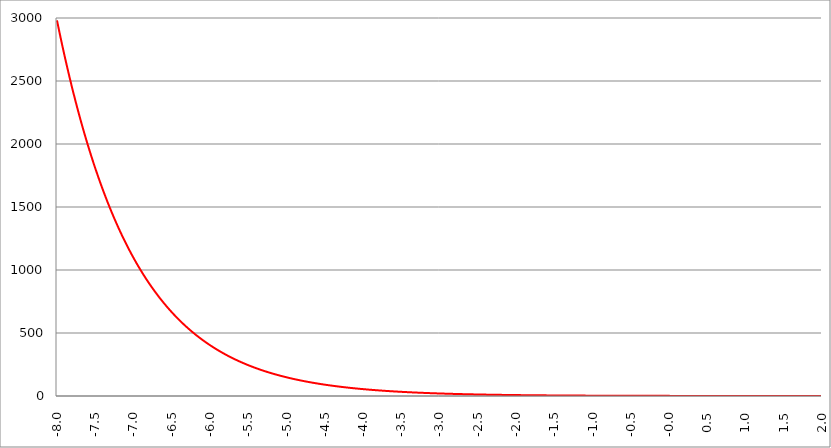
| Category | Series 1 | Series 0 | Series 2 |
|---|---|---|---|
| -8.0 | 2980.958 |  |  |
| -7.995 | 2966.09 |  |  |
| -7.99 | 2951.297 |  |  |
| -7.985 | 2936.577 |  |  |
| -7.98 | 2921.931 |  |  |
| -7.975 | 2907.358 |  |  |
| -7.97 | 2892.857 |  |  |
| -7.965000000000001 | 2878.429 |  |  |
| -7.960000000000001 | 2864.073 |  |  |
| -7.955000000000001 | 2849.788 |  |  |
| -7.950000000000001 | 2835.575 |  |  |
| -7.945000000000001 | 2821.432 |  |  |
| -7.940000000000001 | 2807.361 |  |  |
| -7.935000000000001 | 2793.359 |  |  |
| -7.930000000000001 | 2779.427 |  |  |
| -7.925000000000002 | 2765.564 |  |  |
| -7.920000000000002 | 2751.771 |  |  |
| -7.915000000000002 | 2738.047 |  |  |
| -7.910000000000002 | 2724.39 |  |  |
| -7.905000000000002 | 2710.803 |  |  |
| -7.900000000000002 | 2697.282 |  |  |
| -7.895000000000002 | 2683.83 |  |  |
| -7.890000000000002 | 2670.444 |  |  |
| -7.885000000000002 | 2657.125 |  |  |
| -7.880000000000002 | 2643.873 |  |  |
| -7.875000000000003 | 2630.686 |  |  |
| -7.870000000000003 | 2617.566 |  |  |
| -7.865000000000003 | 2604.51 |  |  |
| -7.860000000000003 | 2591.52 |  |  |
| -7.855000000000003 | 2578.595 |  |  |
| -7.850000000000003 | 2565.734 |  |  |
| -7.845000000000003 | 2552.938 |  |  |
| -7.840000000000003 | 2540.205 |  |  |
| -7.835000000000003 | 2527.536 |  |  |
| -7.830000000000004 | 2514.929 |  |  |
| -7.825000000000004 | 2502.386 |  |  |
| -7.820000000000004 | 2489.905 |  |  |
| -7.815000000000004 | 2477.487 |  |  |
| -7.810000000000004 | 2465.13 |  |  |
| -7.805000000000004 | 2452.836 |  |  |
| -7.800000000000004 | 2440.602 |  |  |
| -7.795000000000004 | 2428.429 |  |  |
| -7.790000000000004 | 2416.318 |  |  |
| -7.785000000000004 | 2404.266 |  |  |
| -7.780000000000004 | 2392.275 |  |  |
| -7.775000000000004 | 2380.343 |  |  |
| -7.770000000000004 | 2368.471 |  |  |
| -7.765000000000005 | 2356.658 |  |  |
| -7.760000000000005 | 2344.905 |  |  |
| -7.755000000000005 | 2333.209 |  |  |
| -7.750000000000005 | 2321.572 |  |  |
| -7.745000000000005 | 2309.994 |  |  |
| -7.740000000000005 | 2298.472 |  |  |
| -7.735000000000005 | 2287.009 |  |  |
| -7.730000000000005 | 2275.602 |  |  |
| -7.725000000000006 | 2264.253 |  |  |
| -7.720000000000006 | 2252.96 |  |  |
| -7.715000000000006 | 2241.723 |  |  |
| -7.710000000000006 | 2230.542 |  |  |
| -7.705000000000006 | 2219.417 |  |  |
| -7.700000000000006 | 2208.348 |  |  |
| -7.695000000000006 | 2197.334 |  |  |
| -7.690000000000006 | 2186.375 |  |  |
| -7.685000000000007 | 2175.47 |  |  |
| -7.680000000000007 | 2164.62 |  |  |
| -7.675000000000007 | 2153.824 |  |  |
| -7.670000000000007 | 2143.081 |  |  |
| -7.665000000000007 | 2132.393 |  |  |
| -7.660000000000007 | 2121.757 |  |  |
| -7.655000000000007 | 2111.175 |  |  |
| -7.650000000000007 | 2100.646 |  |  |
| -7.645000000000007 | 2090.169 |  |  |
| -7.640000000000008 | 2079.744 |  |  |
| -7.635000000000008 | 2069.371 |  |  |
| -7.630000000000008 | 2059.05 |  |  |
| -7.625000000000008 | 2048.78 |  |  |
| -7.620000000000008 | 2038.562 |  |  |
| -7.615000000000008 | 2028.395 |  |  |
| -7.610000000000008 | 2018.278 |  |  |
| -7.605000000000008 | 2008.212 |  |  |
| -7.600000000000008 | 1998.196 |  |  |
| -7.595000000000009 | 1988.23 |  |  |
| -7.590000000000009 | 1978.314 |  |  |
| -7.585000000000009 | 1968.447 |  |  |
| -7.580000000000009 | 1958.629 |  |  |
| -7.57500000000001 | 1948.86 |  |  |
| -7.57000000000001 | 1939.14 |  |  |
| -7.565000000000009 | 1929.469 |  |  |
| -7.560000000000009 | 1919.846 |  |  |
| -7.555000000000009 | 1910.27 |  |  |
| -7.55000000000001 | 1900.743 |  |  |
| -7.54500000000001 | 1891.263 |  |  |
| -7.54000000000001 | 1881.83 |  |  |
| -7.53500000000001 | 1872.444 |  |  |
| -7.53000000000001 | 1863.106 |  |  |
| -7.52500000000001 | 1853.813 |  |  |
| -7.52000000000001 | 1844.567 |  |  |
| -7.51500000000001 | 1835.367 |  |  |
| -7.51000000000001 | 1826.214 |  |  |
| -7.505000000000011 | 1817.105 |  |  |
| -7.500000000000011 | 1808.042 |  |  |
| -7.495000000000011 | 1799.025 |  |  |
| -7.490000000000011 | 1790.052 |  |  |
| -7.485000000000011 | 1781.124 |  |  |
| -7.480000000000011 | 1772.241 |  |  |
| -7.475000000000011 | 1763.402 |  |  |
| -7.470000000000011 | 1754.607 |  |  |
| -7.465000000000011 | 1745.856 |  |  |
| -7.460000000000011 | 1737.148 |  |  |
| -7.455000000000012 | 1728.484 |  |  |
| -7.450000000000012 | 1719.863 |  |  |
| -7.445000000000012 | 1711.285 |  |  |
| -7.440000000000012 | 1702.75 |  |  |
| -7.435000000000012 | 1694.258 |  |  |
| -7.430000000000012 | 1685.808 |  |  |
| -7.425000000000012 | 1677.4 |  |  |
| -7.420000000000012 | 1669.034 |  |  |
| -7.415000000000012 | 1660.709 |  |  |
| -7.410000000000013 | 1652.426 |  |  |
| -7.405000000000013 | 1644.185 |  |  |
| -7.400000000000013 | 1635.984 |  |  |
| -7.395000000000013 | 1627.825 |  |  |
| -7.390000000000013 | 1619.706 |  |  |
| -7.385000000000013 | 1611.628 |  |  |
| -7.380000000000013 | 1603.59 |  |  |
| -7.375000000000013 | 1595.592 |  |  |
| -7.370000000000013 | 1587.634 |  |  |
| -7.365000000000013 | 1579.715 |  |  |
| -7.360000000000014 | 1571.837 |  |  |
| -7.355000000000014 | 1563.997 |  |  |
| -7.350000000000014 | 1556.197 |  |  |
| -7.345000000000014 | 1548.435 |  |  |
| -7.340000000000014 | 1540.712 |  |  |
| -7.335000000000014 | 1533.028 |  |  |
| -7.330000000000014 | 1525.382 |  |  |
| -7.325000000000014 | 1517.774 |  |  |
| -7.320000000000014 | 1510.204 |  |  |
| -7.315000000000015 | 1502.672 |  |  |
| -7.310000000000015 | 1495.177 |  |  |
| -7.305000000000015 | 1487.72 |  |  |
| -7.300000000000015 | 1480.3 |  |  |
| -7.295000000000015 | 1472.917 |  |  |
| -7.290000000000015 | 1465.571 |  |  |
| -7.285000000000015 | 1458.261 |  |  |
| -7.280000000000015 | 1450.988 |  |  |
| -7.275000000000015 | 1443.751 |  |  |
| -7.270000000000015 | 1436.55 |  |  |
| -7.265000000000016 | 1429.386 |  |  |
| -7.260000000000016 | 1422.257 |  |  |
| -7.255000000000016 | 1415.163 |  |  |
| -7.250000000000016 | 1408.105 |  |  |
| -7.245000000000016 | 1401.082 |  |  |
| -7.240000000000016 | 1394.094 |  |  |
| -7.235000000000016 | 1387.141 |  |  |
| -7.230000000000016 | 1380.223 |  |  |
| -7.225000000000017 | 1373.339 |  |  |
| -7.220000000000017 | 1366.489 |  |  |
| -7.215000000000017 | 1359.674 |  |  |
| -7.210000000000017 | 1352.892 |  |  |
| -7.205000000000017 | 1346.145 |  |  |
| -7.200000000000017 | 1339.431 |  |  |
| -7.195000000000017 | 1332.75 |  |  |
| -7.190000000000017 | 1326.103 |  |  |
| -7.185000000000017 | 1319.489 |  |  |
| -7.180000000000017 | 1312.908 |  |  |
| -7.175000000000018 | 1306.36 |  |  |
| -7.170000000000018 | 1299.845 |  |  |
| -7.165000000000018 | 1293.362 |  |  |
| -7.160000000000018 | 1286.911 |  |  |
| -7.155000000000018 | 1280.492 |  |  |
| -7.150000000000018 | 1274.106 |  |  |
| -7.145000000000018 | 1267.751 |  |  |
| -7.140000000000018 | 1261.428 |  |  |
| -7.135000000000018 | 1255.137 |  |  |
| -7.130000000000019 | 1248.877 |  |  |
| -7.125000000000019 | 1242.648 |  |  |
| -7.120000000000019 | 1236.45 |  |  |
| -7.115000000000019 | 1230.284 |  |  |
| -7.110000000000019 | 1224.148 |  |  |
| -7.105000000000019 | 1218.042 |  |  |
| -7.100000000000019 | 1211.967 |  |  |
| -7.095000000000019 | 1205.922 |  |  |
| -7.090000000000019 | 1199.908 |  |  |
| -7.085000000000019 | 1193.923 |  |  |
| -7.08000000000002 | 1187.969 |  |  |
| -7.07500000000002 | 1182.044 |  |  |
| -7.07000000000002 | 1176.148 |  |  |
| -7.06500000000002 | 1170.282 |  |  |
| -7.06000000000002 | 1164.445 |  |  |
| -7.05500000000002 | 1158.637 |  |  |
| -7.05000000000002 | 1152.859 |  |  |
| -7.04500000000002 | 1147.109 |  |  |
| -7.04000000000002 | 1141.388 |  |  |
| -7.03500000000002 | 1135.695 |  |  |
| -7.03000000000002 | 1130.031 |  |  |
| -7.025000000000021 | 1124.395 |  |  |
| -7.020000000000021 | 1118.787 |  |  |
| -7.015000000000021 | 1113.207 |  |  |
| -7.010000000000021 | 1107.655 |  |  |
| -7.005000000000021 | 1102.13 |  |  |
| -7.000000000000021 | 1096.633 |  |  |
| -6.995000000000021 | 1091.164 |  |  |
| -6.990000000000021 | 1085.721 |  |  |
| -6.985000000000021 | 1080.306 |  |  |
| -6.980000000000021 | 1074.918 |  |  |
| -6.975000000000021 | 1069.557 |  |  |
| -6.970000000000021 | 1064.223 |  |  |
| -6.965000000000022 | 1058.915 |  |  |
| -6.960000000000022 | 1053.634 |  |  |
| -6.955000000000022 | 1048.379 |  |  |
| -6.950000000000022 | 1043.15 |  |  |
| -6.945000000000022 | 1037.947 |  |  |
| -6.940000000000022 | 1032.77 |  |  |
| -6.935000000000022 | 1027.619 |  |  |
| -6.930000000000022 | 1022.494 |  |  |
| -6.925000000000023 | 1017.394 |  |  |
| -6.920000000000023 | 1012.32 |  |  |
| -6.915000000000023 | 1007.271 |  |  |
| -6.910000000000023 | 1002.247 |  |  |
| -6.905000000000023 | 997.249 |  |  |
| -6.900000000000023 | 992.275 |  |  |
| -6.895000000000023 | 987.326 |  |  |
| -6.890000000000024 | 982.401 |  |  |
| -6.885000000000024 | 977.502 |  |  |
| -6.880000000000024 | 972.626 |  |  |
| -6.875000000000024 | 967.775 |  |  |
| -6.870000000000024 | 962.949 |  |  |
| -6.865000000000024 | 958.146 |  |  |
| -6.860000000000024 | 953.367 |  |  |
| -6.855000000000024 | 948.612 |  |  |
| -6.850000000000024 | 943.881 |  |  |
| -6.845000000000024 | 939.173 |  |  |
| -6.840000000000024 | 934.489 |  |  |
| -6.835000000000024 | 929.828 |  |  |
| -6.830000000000024 | 925.191 |  |  |
| -6.825000000000025 | 920.576 |  |  |
| -6.820000000000025 | 915.985 |  |  |
| -6.815000000000025 | 911.417 |  |  |
| -6.810000000000025 | 906.871 |  |  |
| -6.805000000000025 | 902.348 |  |  |
| -6.800000000000025 | 897.847 |  |  |
| -6.795000000000025 | 893.369 |  |  |
| -6.790000000000025 | 888.914 |  |  |
| -6.785000000000025 | 884.48 |  |  |
| -6.780000000000025 | 880.069 |  |  |
| -6.775000000000026 | 875.679 |  |  |
| -6.770000000000026 | 871.312 |  |  |
| -6.765000000000026 | 866.966 |  |  |
| -6.760000000000026 | 862.642 |  |  |
| -6.755000000000026 | 858.34 |  |  |
| -6.750000000000026 | 854.059 |  |  |
| -6.745000000000026 | 849.799 |  |  |
| -6.740000000000026 | 845.561 |  |  |
| -6.735000000000026 | 841.343 |  |  |
| -6.730000000000026 | 837.147 |  |  |
| -6.725000000000027 | 832.972 |  |  |
| -6.720000000000027 | 828.818 |  |  |
| -6.715000000000027 | 824.684 |  |  |
| -6.710000000000027 | 820.571 |  |  |
| -6.705000000000027 | 816.478 |  |  |
| -6.700000000000027 | 812.406 |  |  |
| -6.695000000000028 | 808.354 |  |  |
| -6.690000000000028 | 804.322 |  |  |
| -6.685000000000028 | 800.311 |  |  |
| -6.680000000000028 | 796.319 |  |  |
| -6.675000000000028 | 792.347 |  |  |
| -6.670000000000028 | 788.396 |  |  |
| -6.665000000000028 | 784.463 |  |  |
| -6.660000000000028 | 780.551 |  |  |
| -6.655000000000029 | 776.658 |  |  |
| -6.650000000000029 | 772.784 |  |  |
| -6.645000000000029 | 768.93 |  |  |
| -6.640000000000029 | 765.095 |  |  |
| -6.63500000000003 | 761.279 |  |  |
| -6.63000000000003 | 757.482 |  |  |
| -6.625000000000029 | 753.704 |  |  |
| -6.620000000000029 | 749.945 |  |  |
| -6.615000000000029 | 746.205 |  |  |
| -6.61000000000003 | 742.483 |  |  |
| -6.60500000000003 | 738.78 |  |  |
| -6.60000000000003 | 735.095 |  |  |
| -6.59500000000003 | 731.429 |  |  |
| -6.59000000000003 | 727.781 |  |  |
| -6.58500000000003 | 724.151 |  |  |
| -6.58000000000003 | 720.539 |  |  |
| -6.57500000000003 | 716.946 |  |  |
| -6.57000000000003 | 713.37 |  |  |
| -6.565000000000031 | 709.812 |  |  |
| -6.560000000000031 | 706.272 |  |  |
| -6.555000000000031 | 702.749 |  |  |
| -6.550000000000031 | 699.244 |  |  |
| -6.545000000000031 | 695.757 |  |  |
| -6.540000000000031 | 692.287 |  |  |
| -6.535000000000031 | 688.834 |  |  |
| -6.530000000000031 | 685.398 |  |  |
| -6.525000000000031 | 681.98 |  |  |
| -6.520000000000032 | 678.578 |  |  |
| -6.515000000000032 | 675.194 |  |  |
| -6.510000000000032 | 671.826 |  |  |
| -6.505000000000032 | 668.476 |  |  |
| -6.500000000000032 | 665.142 |  |  |
| -6.495000000000032 | 661.824 |  |  |
| -6.490000000000032 | 658.523 |  |  |
| -6.485000000000032 | 655.239 |  |  |
| -6.480000000000032 | 651.971 |  |  |
| -6.475000000000032 | 648.719 |  |  |
| -6.470000000000032 | 645.484 |  |  |
| -6.465000000000033 | 642.264 |  |  |
| -6.460000000000033 | 639.061 |  |  |
| -6.455000000000033 | 635.874 |  |  |
| -6.450000000000033 | 632.702 |  |  |
| -6.445000000000033 | 629.547 |  |  |
| -6.440000000000033 | 626.407 |  |  |
| -6.435000000000033 | 623.283 |  |  |
| -6.430000000000033 | 620.174 |  |  |
| -6.425000000000034 | 617.081 |  |  |
| -6.420000000000034 | 614.003 |  |  |
| -6.415000000000034 | 610.941 |  |  |
| -6.410000000000034 | 607.894 |  |  |
| -6.405000000000034 | 604.862 |  |  |
| -6.400000000000034 | 601.845 |  |  |
| -6.395000000000034 | 598.843 |  |  |
| -6.390000000000034 | 595.857 |  |  |
| -6.385000000000034 | 592.885 |  |  |
| -6.380000000000034 | 589.928 |  |  |
| -6.375000000000034 | 586.985 |  |  |
| -6.370000000000034 | 584.058 |  |  |
| -6.365000000000035 | 581.145 |  |  |
| -6.360000000000035 | 578.246 |  |  |
| -6.355000000000035 | 575.362 |  |  |
| -6.350000000000035 | 572.493 |  |  |
| -6.345000000000035 | 569.637 |  |  |
| -6.340000000000035 | 566.796 |  |  |
| -6.335000000000035 | 563.969 |  |  |
| -6.330000000000035 | 561.157 |  |  |
| -6.325000000000036 | 558.358 |  |  |
| -6.320000000000036 | 555.573 |  |  |
| -6.315000000000036 | 552.802 |  |  |
| -6.310000000000036 | 550.045 |  |  |
| -6.305000000000036 | 547.302 |  |  |
| -6.300000000000036 | 544.572 |  |  |
| -6.295000000000036 | 541.856 |  |  |
| -6.290000000000036 | 539.153 |  |  |
| -6.285000000000036 | 536.464 |  |  |
| -6.280000000000036 | 533.789 |  |  |
| -6.275000000000036 | 531.126 |  |  |
| -6.270000000000036 | 528.477 |  |  |
| -6.265000000000037 | 525.842 |  |  |
| -6.260000000000037 | 523.219 |  |  |
| -6.255000000000037 | 520.609 |  |  |
| -6.250000000000037 | 518.013 |  |  |
| -6.245000000000037 | 515.429 |  |  |
| -6.240000000000037 | 512.859 |  |  |
| -6.235000000000037 | 510.301 |  |  |
| -6.230000000000037 | 507.755 |  |  |
| -6.225000000000038 | 505.223 |  |  |
| -6.220000000000038 | 502.703 |  |  |
| -6.215000000000038 | 500.196 |  |  |
| -6.210000000000038 | 497.701 |  |  |
| -6.205000000000038 | 495.219 |  |  |
| -6.200000000000038 | 492.749 |  |  |
| -6.195000000000038 | 490.291 |  |  |
| -6.190000000000039 | 487.846 |  |  |
| -6.185000000000039 | 485.413 |  |  |
| -6.180000000000039 | 482.992 |  |  |
| -6.175000000000039 | 480.583 |  |  |
| -6.170000000000039 | 478.186 |  |  |
| -6.165000000000039 | 475.801 |  |  |
| -6.160000000000039 | 473.428 |  |  |
| -6.155000000000039 | 471.067 |  |  |
| -6.150000000000039 | 468.717 |  |  |
| -6.14500000000004 | 466.38 |  |  |
| -6.14000000000004 | 464.054 |  |  |
| -6.13500000000004 | 461.739 |  |  |
| -6.13000000000004 | 459.436 |  |  |
| -6.12500000000004 | 457.145 |  |  |
| -6.12000000000004 | 454.865 |  |  |
| -6.11500000000004 | 452.596 |  |  |
| -6.11000000000004 | 450.339 |  |  |
| -6.10500000000004 | 448.093 |  |  |
| -6.10000000000004 | 445.858 |  |  |
| -6.095000000000041 | 443.634 |  |  |
| -6.090000000000041 | 441.421 |  |  |
| -6.085000000000041 | 439.22 |  |  |
| -6.080000000000041 | 437.029 |  |  |
| -6.075000000000041 | 434.85 |  |  |
| -6.070000000000041 | 432.681 |  |  |
| -6.065000000000041 | 430.523 |  |  |
| -6.060000000000041 | 428.375 |  |  |
| -6.055000000000041 | 426.239 |  |  |
| -6.050000000000042 | 424.113 |  |  |
| -6.045000000000042 | 421.998 |  |  |
| -6.040000000000042 | 419.893 |  |  |
| -6.035000000000042 | 417.799 |  |  |
| -6.030000000000042 | 415.715 |  |  |
| -6.025000000000042 | 413.642 |  |  |
| -6.020000000000042 | 411.579 |  |  |
| -6.015000000000042 | 409.526 |  |  |
| -6.010000000000042 | 407.483 |  |  |
| -6.005000000000043 | 405.451 |  |  |
| -6.000000000000043 | 403.429 |  |  |
| -5.995000000000043 | 401.417 |  |  |
| -5.990000000000043 | 399.415 |  |  |
| -5.985000000000043 | 397.423 |  |  |
| -5.980000000000043 | 395.44 |  |  |
| -5.975000000000043 | 393.468 |  |  |
| -5.970000000000043 | 391.506 |  |  |
| -5.965000000000043 | 389.553 |  |  |
| -5.960000000000043 | 387.61 |  |  |
| -5.955000000000044 | 385.677 |  |  |
| -5.950000000000044 | 383.753 |  |  |
| -5.945000000000044 | 381.839 |  |  |
| -5.940000000000044 | 379.935 |  |  |
| -5.935000000000044 | 378.04 |  |  |
| -5.930000000000044 | 376.155 |  |  |
| -5.925000000000044 | 374.278 |  |  |
| -5.920000000000044 | 372.412 |  |  |
| -5.915000000000044 | 370.554 |  |  |
| -5.910000000000044 | 368.706 |  |  |
| -5.905000000000044 | 366.867 |  |  |
| -5.900000000000044 | 365.037 |  |  |
| -5.895000000000045 | 363.217 |  |  |
| -5.890000000000045 | 361.405 |  |  |
| -5.885000000000045 | 359.603 |  |  |
| -5.880000000000045 | 357.809 |  |  |
| -5.875000000000045 | 356.025 |  |  |
| -5.870000000000045 | 354.249 |  |  |
| -5.865000000000045 | 352.482 |  |  |
| -5.860000000000046 | 350.724 |  |  |
| -5.855000000000046 | 348.975 |  |  |
| -5.850000000000046 | 347.234 |  |  |
| -5.845000000000046 | 345.503 |  |  |
| -5.840000000000046 | 343.779 |  |  |
| -5.835000000000046 | 342.065 |  |  |
| -5.830000000000046 | 340.359 |  |  |
| -5.825000000000046 | 338.661 |  |  |
| -5.820000000000046 | 336.972 |  |  |
| -5.815000000000047 | 335.291 |  |  |
| -5.810000000000047 | 333.619 |  |  |
| -5.805000000000047 | 331.955 |  |  |
| -5.800000000000047 | 330.3 |  |  |
| -5.795000000000047 | 328.652 |  |  |
| -5.790000000000047 | 327.013 |  |  |
| -5.785000000000047 | 325.382 |  |  |
| -5.780000000000047 | 323.759 |  |  |
| -5.775000000000047 | 322.144 |  |  |
| -5.770000000000047 | 320.538 |  |  |
| -5.765000000000048 | 318.939 |  |  |
| -5.760000000000048 | 317.348 |  |  |
| -5.755000000000048 | 315.766 |  |  |
| -5.750000000000048 | 314.191 |  |  |
| -5.745000000000048 | 312.624 |  |  |
| -5.740000000000048 | 311.064 |  |  |
| -5.735000000000048 | 309.513 |  |  |
| -5.730000000000048 | 307.969 |  |  |
| -5.725000000000048 | 306.433 |  |  |
| -5.720000000000049 | 304.905 |  |  |
| -5.715000000000049 | 303.384 |  |  |
| -5.710000000000049 | 301.871 |  |  |
| -5.705000000000049 | 300.365 |  |  |
| -5.700000000000049 | 298.867 |  |  |
| -5.695000000000049 | 297.377 |  |  |
| -5.690000000000049 | 295.894 |  |  |
| -5.685000000000049 | 294.418 |  |  |
| -5.680000000000049 | 292.949 |  |  |
| -5.675000000000049 | 291.488 |  |  |
| -5.67000000000005 | 290.035 |  |  |
| -5.66500000000005 | 288.588 |  |  |
| -5.66000000000005 | 287.149 |  |  |
| -5.65500000000005 | 285.716 |  |  |
| -5.65000000000005 | 284.291 |  |  |
| -5.64500000000005 | 282.874 |  |  |
| -5.64000000000005 | 281.463 |  |  |
| -5.63500000000005 | 280.059 |  |  |
| -5.63000000000005 | 278.662 |  |  |
| -5.625000000000051 | 277.272 |  |  |
| -5.620000000000051 | 275.889 |  |  |
| -5.615000000000051 | 274.513 |  |  |
| -5.610000000000051 | 273.144 |  |  |
| -5.605000000000051 | 271.782 |  |  |
| -5.600000000000051 | 270.426 |  |  |
| -5.595000000000051 | 269.078 |  |  |
| -5.590000000000051 | 267.736 |  |  |
| -5.585000000000051 | 266.4 |  |  |
| -5.580000000000052 | 265.072 |  |  |
| -5.575000000000052 | 263.75 |  |  |
| -5.570000000000052 | 262.434 |  |  |
| -5.565000000000052 | 261.125 |  |  |
| -5.560000000000052 | 259.823 |  |  |
| -5.555000000000052 | 258.527 |  |  |
| -5.550000000000052 | 257.238 |  |  |
| -5.545000000000052 | 255.955 |  |  |
| -5.540000000000052 | 254.678 |  |  |
| -5.535000000000053 | 253.408 |  |  |
| -5.530000000000053 | 252.144 |  |  |
| -5.525000000000053 | 250.886 |  |  |
| -5.520000000000053 | 249.635 |  |  |
| -5.515000000000053 | 248.39 |  |  |
| -5.510000000000053 | 247.151 |  |  |
| -5.505000000000053 | 245.918 |  |  |
| -5.500000000000053 | 244.692 |  |  |
| -5.495000000000053 | 243.472 |  |  |
| -5.490000000000053 | 242.257 |  |  |
| -5.485000000000054 | 241.049 |  |  |
| -5.480000000000054 | 239.847 |  |  |
| -5.475000000000054 | 238.65 |  |  |
| -5.470000000000054 | 237.46 |  |  |
| -5.465000000000054 | 236.276 |  |  |
| -5.460000000000054 | 235.097 |  |  |
| -5.455000000000054 | 233.925 |  |  |
| -5.450000000000054 | 232.758 |  |  |
| -5.445000000000054 | 231.597 |  |  |
| -5.440000000000054 | 230.442 |  |  |
| -5.435000000000054 | 229.293 |  |  |
| -5.430000000000054 | 228.149 |  |  |
| -5.425000000000055 | 227.011 |  |  |
| -5.420000000000055 | 225.879 |  |  |
| -5.415000000000055 | 224.753 |  |  |
| -5.410000000000055 | 223.632 |  |  |
| -5.405000000000055 | 222.516 |  |  |
| -5.400000000000055 | 221.406 |  |  |
| -5.395000000000055 | 220.302 |  |  |
| -5.390000000000056 | 219.203 |  |  |
| -5.385000000000056 | 218.11 |  |  |
| -5.380000000000056 | 217.022 |  |  |
| -5.375000000000056 | 215.94 |  |  |
| -5.370000000000056 | 214.863 |  |  |
| -5.365000000000056 | 213.791 |  |  |
| -5.360000000000056 | 212.725 |  |  |
| -5.355000000000056 | 211.664 |  |  |
| -5.350000000000056 | 210.608 |  |  |
| -5.345000000000057 | 209.558 |  |  |
| -5.340000000000057 | 208.513 |  |  |
| -5.335000000000057 | 207.473 |  |  |
| -5.330000000000057 | 206.438 |  |  |
| -5.325000000000057 | 205.408 |  |  |
| -5.320000000000057 | 204.384 |  |  |
| -5.315000000000057 | 203.365 |  |  |
| -5.310000000000057 | 202.35 |  |  |
| -5.305000000000057 | 201.341 |  |  |
| -5.300000000000058 | 200.337 |  |  |
| -5.295000000000058 | 199.338 |  |  |
| -5.290000000000058 | 198.343 |  |  |
| -5.285000000000058 | 197.354 |  |  |
| -5.280000000000058 | 196.37 |  |  |
| -5.275000000000058 | 195.39 |  |  |
| -5.270000000000058 | 194.416 |  |  |
| -5.265000000000058 | 193.446 |  |  |
| -5.260000000000058 | 192.481 |  |  |
| -5.255000000000058 | 191.521 |  |  |
| -5.250000000000059 | 190.566 |  |  |
| -5.245000000000059 | 189.616 |  |  |
| -5.240000000000059 | 188.67 |  |  |
| -5.235000000000059 | 187.729 |  |  |
| -5.23000000000006 | 186.793 |  |  |
| -5.225000000000059 | 185.861 |  |  |
| -5.220000000000059 | 184.934 |  |  |
| -5.215000000000059 | 184.012 |  |  |
| -5.210000000000059 | 183.094 |  |  |
| -5.20500000000006 | 182.181 |  |  |
| -5.20000000000006 | 181.272 |  |  |
| -5.19500000000006 | 180.368 |  |  |
| -5.19000000000006 | 179.469 |  |  |
| -5.18500000000006 | 178.573 |  |  |
| -5.18000000000006 | 177.683 |  |  |
| -5.17500000000006 | 176.797 |  |  |
| -5.17000000000006 | 175.915 |  |  |
| -5.16500000000006 | 175.037 |  |  |
| -5.160000000000061 | 174.164 |  |  |
| -5.155000000000061 | 173.296 |  |  |
| -5.150000000000061 | 172.431 |  |  |
| -5.145000000000061 | 171.571 |  |  |
| -5.140000000000061 | 170.716 |  |  |
| -5.135000000000061 | 169.864 |  |  |
| -5.130000000000061 | 169.017 |  |  |
| -5.125000000000061 | 168.174 |  |  |
| -5.120000000000061 | 167.335 |  |  |
| -5.115000000000061 | 166.501 |  |  |
| -5.110000000000062 | 165.67 |  |  |
| -5.105000000000062 | 164.844 |  |  |
| -5.100000000000062 | 164.022 |  |  |
| -5.095000000000062 | 163.204 |  |  |
| -5.090000000000062 | 162.39 |  |  |
| -5.085000000000062 | 161.58 |  |  |
| -5.080000000000062 | 160.774 |  |  |
| -5.075000000000062 | 159.972 |  |  |
| -5.070000000000062 | 159.174 |  |  |
| -5.065000000000063 | 158.38 |  |  |
| -5.060000000000063 | 157.591 |  |  |
| -5.055000000000063 | 156.805 |  |  |
| -5.050000000000063 | 156.022 |  |  |
| -5.045000000000063 | 155.244 |  |  |
| -5.040000000000063 | 154.47 |  |  |
| -5.035000000000063 | 153.7 |  |  |
| -5.030000000000063 | 152.933 |  |  |
| -5.025000000000063 | 152.17 |  |  |
| -5.020000000000064 | 151.411 |  |  |
| -5.015000000000064 | 150.656 |  |  |
| -5.010000000000064 | 149.905 |  |  |
| -5.005000000000064 | 149.157 |  |  |
| -5.000000000000064 | 148.413 |  |  |
| -4.995000000000064 | 147.673 |  |  |
| -4.990000000000064 | 146.936 |  |  |
| -4.985000000000064 | 146.204 |  |  |
| -4.980000000000064 | 145.474 |  |  |
| -4.975000000000064 | 144.749 |  |  |
| -4.970000000000064 | 144.027 |  |  |
| -4.965000000000064 | 143.309 |  |  |
| -4.960000000000064 | 142.594 |  |  |
| -4.955000000000064 | 141.883 |  |  |
| -4.950000000000064 | 141.175 |  |  |
| -4.945000000000065 | 140.471 |  |  |
| -4.940000000000065 | 139.77 |  |  |
| -4.935000000000065 | 139.073 |  |  |
| -4.930000000000065 | 138.38 |  |  |
| -4.925000000000065 | 137.689 |  |  |
| -4.920000000000065 | 137.003 |  |  |
| -4.915000000000065 | 136.319 |  |  |
| -4.910000000000065 | 135.639 |  |  |
| -4.905000000000065 | 134.963 |  |  |
| -4.900000000000066 | 134.29 |  |  |
| -4.895000000000066 | 133.62 |  |  |
| -4.890000000000066 | 132.954 |  |  |
| -4.885000000000066 | 132.29 |  |  |
| -4.880000000000066 | 131.631 |  |  |
| -4.875000000000066 | 130.974 |  |  |
| -4.870000000000066 | 130.321 |  |  |
| -4.865000000000067 | 129.671 |  |  |
| -4.860000000000067 | 129.024 |  |  |
| -4.855000000000067 | 128.381 |  |  |
| -4.850000000000067 | 127.74 |  |  |
| -4.845000000000067 | 127.103 |  |  |
| -4.840000000000067 | 126.469 |  |  |
| -4.835000000000067 | 125.839 |  |  |
| -4.830000000000067 | 125.211 |  |  |
| -4.825000000000068 | 124.586 |  |  |
| -4.820000000000068 | 123.965 |  |  |
| -4.815000000000068 | 123.347 |  |  |
| -4.810000000000068 | 122.732 |  |  |
| -4.805000000000068 | 122.119 |  |  |
| -4.800000000000068 | 121.51 |  |  |
| -4.795000000000068 | 120.904 |  |  |
| -4.790000000000068 | 120.301 |  |  |
| -4.785000000000068 | 119.701 |  |  |
| -4.780000000000068 | 119.104 |  |  |
| -4.775000000000068 | 118.51 |  |  |
| -4.770000000000068 | 117.919 |  |  |
| -4.765000000000069 | 117.331 |  |  |
| -4.760000000000069 | 116.746 |  |  |
| -4.75500000000007 | 116.164 |  |  |
| -4.75000000000007 | 115.584 |  |  |
| -4.74500000000007 | 115.008 |  |  |
| -4.74000000000007 | 114.434 |  |  |
| -4.73500000000007 | 113.863 |  |  |
| -4.73000000000007 | 113.296 |  |  |
| -4.72500000000007 | 112.73 |  |  |
| -4.72000000000007 | 112.168 |  |  |
| -4.71500000000007 | 111.609 |  |  |
| -4.71000000000007 | 111.052 |  |  |
| -4.70500000000007 | 110.498 |  |  |
| -4.70000000000007 | 109.947 |  |  |
| -4.69500000000007 | 109.399 |  |  |
| -4.69000000000007 | 108.853 |  |  |
| -4.685000000000071 | 108.31 |  |  |
| -4.680000000000071 | 107.77 |  |  |
| -4.675000000000071 | 107.233 |  |  |
| -4.670000000000071 | 106.698 |  |  |
| -4.665000000000071 | 106.166 |  |  |
| -4.660000000000071 | 105.636 |  |  |
| -4.655000000000071 | 105.109 |  |  |
| -4.650000000000071 | 104.585 |  |  |
| -4.645000000000071 | 104.063 |  |  |
| -4.640000000000072 | 103.544 |  |  |
| -4.635000000000072 | 103.028 |  |  |
| -4.630000000000072 | 102.514 |  |  |
| -4.625000000000072 | 102.003 |  |  |
| -4.620000000000072 | 101.494 |  |  |
| -4.615000000000072 | 100.988 |  |  |
| -4.610000000000072 | 100.484 |  |  |
| -4.605000000000072 | 99.983 |  |  |
| -4.600000000000072 | 99.484 |  |  |
| -4.595000000000073 | 98.988 |  |  |
| -4.590000000000073 | 98.494 |  |  |
| -4.585000000000073 | 98.003 |  |  |
| -4.580000000000073 | 97.514 |  |  |
| -4.575000000000073 | 97.028 |  |  |
| -4.570000000000073 | 96.544 |  |  |
| -4.565000000000073 | 96.063 |  |  |
| -4.560000000000073 | 95.583 |  |  |
| -4.555000000000073 | 95.107 |  |  |
| -4.550000000000074 | 94.632 |  |  |
| -4.545000000000074 | 94.16 |  |  |
| -4.540000000000074 | 93.691 |  |  |
| -4.535000000000074 | 93.224 |  |  |
| -4.530000000000074 | 92.759 |  |  |
| -4.525000000000074 | 92.296 |  |  |
| -4.520000000000074 | 91.836 |  |  |
| -4.515000000000074 | 91.378 |  |  |
| -4.510000000000074 | 90.922 |  |  |
| -4.505000000000074 | 90.468 |  |  |
| -4.500000000000074 | 90.017 |  |  |
| -4.495000000000074 | 89.568 |  |  |
| -4.490000000000074 | 89.121 |  |  |
| -4.485000000000074 | 88.677 |  |  |
| -4.480000000000074 | 88.235 |  |  |
| -4.475000000000075 | 87.795 |  |  |
| -4.470000000000075 | 87.357 |  |  |
| -4.465000000000075 | 86.921 |  |  |
| -4.460000000000075 | 86.488 |  |  |
| -4.455000000000075 | 86.056 |  |  |
| -4.450000000000075 | 85.627 |  |  |
| -4.445000000000075 | 85.2 |  |  |
| -4.440000000000075 | 84.775 |  |  |
| -4.435000000000075 | 84.352 |  |  |
| -4.430000000000076 | 83.931 |  |  |
| -4.425000000000076 | 83.513 |  |  |
| -4.420000000000076 | 83.096 |  |  |
| -4.415000000000076 | 82.682 |  |  |
| -4.410000000000076 | 82.269 |  |  |
| -4.405000000000076 | 81.859 |  |  |
| -4.400000000000076 | 81.451 |  |  |
| -4.395000000000077 | 81.045 |  |  |
| -4.390000000000077 | 80.64 |  |  |
| -4.385000000000077 | 80.238 |  |  |
| -4.380000000000077 | 79.838 |  |  |
| -4.375000000000077 | 79.44 |  |  |
| -4.370000000000077 | 79.044 |  |  |
| -4.365000000000077 | 78.649 |  |  |
| -4.360000000000078 | 78.257 |  |  |
| -4.355000000000078 | 77.867 |  |  |
| -4.350000000000078 | 77.478 |  |  |
| -4.345000000000078 | 77.092 |  |  |
| -4.340000000000078 | 76.708 |  |  |
| -4.335000000000078 | 76.325 |  |  |
| -4.330000000000078 | 75.944 |  |  |
| -4.325000000000078 | 75.566 |  |  |
| -4.320000000000078 | 75.189 |  |  |
| -4.315000000000079 | 74.814 |  |  |
| -4.310000000000079 | 74.44 |  |  |
| -4.305000000000079 | 74.069 |  |  |
| -4.300000000000079 | 73.7 |  |  |
| -4.295000000000079 | 73.332 |  |  |
| -4.29000000000008 | 72.966 |  |  |
| -4.28500000000008 | 72.603 |  |  |
| -4.28000000000008 | 72.24 |  |  |
| -4.27500000000008 | 71.88 |  |  |
| -4.27000000000008 | 71.522 |  |  |
| -4.26500000000008 | 71.165 |  |  |
| -4.26000000000008 | 70.81 |  |  |
| -4.25500000000008 | 70.457 |  |  |
| -4.25000000000008 | 70.105 |  |  |
| -4.24500000000008 | 69.756 |  |  |
| -4.24000000000008 | 69.408 |  |  |
| -4.23500000000008 | 69.062 |  |  |
| -4.23000000000008 | 68.717 |  |  |
| -4.22500000000008 | 68.375 |  |  |
| -4.220000000000081 | 68.033 |  |  |
| -4.215000000000081 | 67.694 |  |  |
| -4.210000000000081 | 67.357 |  |  |
| -4.205000000000081 | 67.021 |  |  |
| -4.200000000000081 | 66.686 |  |  |
| -4.195000000000081 | 66.354 |  |  |
| -4.190000000000081 | 66.023 |  |  |
| -4.185000000000081 | 65.694 |  |  |
| -4.180000000000081 | 65.366 |  |  |
| -4.175000000000082 | 65.04 |  |  |
| -4.170000000000082 | 64.715 |  |  |
| -4.165000000000082 | 64.393 |  |  |
| -4.160000000000082 | 64.072 |  |  |
| -4.155000000000082 | 63.752 |  |  |
| -4.150000000000082 | 63.434 |  |  |
| -4.145000000000082 | 63.118 |  |  |
| -4.140000000000082 | 62.803 |  |  |
| -4.135000000000082 | 62.49 |  |  |
| -4.130000000000082 | 62.178 |  |  |
| -4.125000000000083 | 61.868 |  |  |
| -4.120000000000083 | 61.559 |  |  |
| -4.115000000000083 | 61.252 |  |  |
| -4.110000000000083 | 60.947 |  |  |
| -4.105000000000083 | 60.643 |  |  |
| -4.100000000000083 | 60.34 |  |  |
| -4.095000000000083 | 60.039 |  |  |
| -4.090000000000083 | 59.74 |  |  |
| -4.085000000000083 | 59.442 |  |  |
| -4.080000000000084 | 59.145 |  |  |
| -4.075000000000084 | 58.85 |  |  |
| -4.070000000000084 | 58.557 |  |  |
| -4.065000000000084 | 58.265 |  |  |
| -4.060000000000084 | 57.974 |  |  |
| -4.055000000000084 | 57.685 |  |  |
| -4.050000000000084 | 57.397 |  |  |
| -4.045000000000084 | 57.111 |  |  |
| -4.040000000000084 | 56.826 |  |  |
| -4.035000000000084 | 56.543 |  |  |
| -4.030000000000084 | 56.261 |  |  |
| -4.025000000000085 | 55.98 |  |  |
| -4.020000000000085 | 55.701 |  |  |
| -4.015000000000085 | 55.423 |  |  |
| -4.010000000000085 | 55.147 |  |  |
| -4.005000000000085 | 54.872 |  |  |
| -4.000000000000085 | 54.598 |  |  |
| -3.995000000000085 | 54.326 |  |  |
| -3.990000000000085 | 54.055 |  |  |
| -3.985000000000086 | 53.785 |  |  |
| -3.980000000000086 | 53.517 |  |  |
| -3.975000000000086 | 53.25 |  |  |
| -3.970000000000086 | 52.985 |  |  |
| -3.965000000000086 | 52.72 |  |  |
| -3.960000000000086 | 52.457 |  |  |
| -3.955000000000086 | 52.196 |  |  |
| -3.950000000000086 | 51.935 |  |  |
| -3.945000000000086 | 51.676 |  |  |
| -3.940000000000087 | 51.419 |  |  |
| -3.935000000000087 | 51.162 |  |  |
| -3.930000000000087 | 50.907 |  |  |
| -3.925000000000087 | 50.653 |  |  |
| -3.920000000000087 | 50.4 |  |  |
| -3.915000000000087 | 50.149 |  |  |
| -3.910000000000087 | 49.899 |  |  |
| -3.905000000000087 | 49.65 |  |  |
| -3.900000000000087 | 49.402 |  |  |
| -3.895000000000087 | 49.156 |  |  |
| -3.890000000000088 | 48.911 |  |  |
| -3.885000000000088 | 48.667 |  |  |
| -3.880000000000088 | 48.424 |  |  |
| -3.875000000000088 | 48.183 |  |  |
| -3.870000000000088 | 47.942 |  |  |
| -3.865000000000088 | 47.703 |  |  |
| -3.860000000000088 | 47.465 |  |  |
| -3.855000000000088 | 47.229 |  |  |
| -3.850000000000088 | 46.993 |  |  |
| -3.845000000000089 | 46.759 |  |  |
| -3.840000000000089 | 46.525 |  |  |
| -3.835000000000089 | 46.293 |  |  |
| -3.830000000000089 | 46.063 |  |  |
| -3.825000000000089 | 45.833 |  |  |
| -3.820000000000089 | 45.604 |  |  |
| -3.815000000000089 | 45.377 |  |  |
| -3.810000000000089 | 45.15 |  |  |
| -3.805000000000089 | 44.925 |  |  |
| -3.800000000000089 | 44.701 |  |  |
| -3.79500000000009 | 44.478 |  |  |
| -3.79000000000009 | 44.256 |  |  |
| -3.78500000000009 | 44.036 |  |  |
| -3.78000000000009 | 43.816 |  |  |
| -3.77500000000009 | 43.598 |  |  |
| -3.77000000000009 | 43.38 |  |  |
| -3.76500000000009 | 43.164 |  |  |
| -3.76000000000009 | 42.948 |  |  |
| -3.75500000000009 | 42.734 |  |  |
| -3.750000000000091 | 42.521 |  |  |
| -3.745000000000091 | 42.309 |  |  |
| -3.740000000000091 | 42.098 |  |  |
| -3.735000000000091 | 41.888 |  |  |
| -3.730000000000091 | 41.679 |  |  |
| -3.725000000000091 | 41.471 |  |  |
| -3.720000000000091 | 41.264 |  |  |
| -3.715000000000091 | 41.059 |  |  |
| -3.710000000000091 | 40.854 |  |  |
| -3.705000000000091 | 40.65 |  |  |
| -3.700000000000092 | 40.447 |  |  |
| -3.695000000000092 | 40.246 |  |  |
| -3.690000000000092 | 40.045 |  |  |
| -3.685000000000092 | 39.845 |  |  |
| -3.680000000000092 | 39.646 |  |  |
| -3.675000000000092 | 39.449 |  |  |
| -3.670000000000092 | 39.252 |  |  |
| -3.665000000000092 | 39.056 |  |  |
| -3.660000000000092 | 38.861 |  |  |
| -3.655000000000093 | 38.668 |  |  |
| -3.650000000000093 | 38.475 |  |  |
| -3.645000000000093 | 38.283 |  |  |
| -3.640000000000093 | 38.092 |  |  |
| -3.635000000000093 | 37.902 |  |  |
| -3.630000000000093 | 37.713 |  |  |
| -3.625000000000093 | 37.525 |  |  |
| -3.620000000000093 | 37.338 |  |  |
| -3.615000000000093 | 37.151 |  |  |
| -3.610000000000093 | 36.966 |  |  |
| -3.605000000000094 | 36.782 |  |  |
| -3.600000000000094 | 36.598 |  |  |
| -3.595000000000094 | 36.416 |  |  |
| -3.590000000000094 | 36.234 |  |  |
| -3.585000000000094 | 36.053 |  |  |
| -3.580000000000094 | 35.874 |  |  |
| -3.575000000000094 | 35.695 |  |  |
| -3.570000000000094 | 35.517 |  |  |
| -3.565000000000095 | 35.339 |  |  |
| -3.560000000000095 | 35.163 |  |  |
| -3.555000000000095 | 34.988 |  |  |
| -3.550000000000095 | 34.813 |  |  |
| -3.545000000000095 | 34.64 |  |  |
| -3.540000000000095 | 34.467 |  |  |
| -3.535000000000095 | 34.295 |  |  |
| -3.530000000000095 | 34.124 |  |  |
| -3.525000000000095 | 33.954 |  |  |
| -3.520000000000095 | 33.784 |  |  |
| -3.515000000000096 | 33.616 |  |  |
| -3.510000000000096 | 33.448 |  |  |
| -3.505000000000096 | 33.281 |  |  |
| -3.500000000000096 | 33.115 |  |  |
| -3.495000000000096 | 32.95 |  |  |
| -3.490000000000096 | 32.786 |  |  |
| -3.485000000000096 | 32.622 |  |  |
| -3.480000000000096 | 32.46 |  |  |
| -3.475000000000096 | 32.298 |  |  |
| -3.470000000000097 | 32.137 |  |  |
| -3.465000000000097 | 31.976 |  |  |
| -3.460000000000097 | 31.817 |  |  |
| -3.455000000000097 | 31.658 |  |  |
| -3.450000000000097 | 31.5 |  |  |
| -3.445000000000097 | 31.343 |  |  |
| -3.440000000000097 | 31.187 |  |  |
| -3.435000000000097 | 31.031 |  |  |
| -3.430000000000097 | 30.877 |  |  |
| -3.425000000000097 | 30.723 |  |  |
| -3.420000000000098 | 30.569 |  |  |
| -3.415000000000098 | 30.417 |  |  |
| -3.410000000000098 | 30.265 |  |  |
| -3.405000000000098 | 30.114 |  |  |
| -3.400000000000098 | 29.964 |  |  |
| -3.395000000000098 | 29.815 |  |  |
| -3.390000000000098 | 29.666 |  |  |
| -3.385000000000098 | 29.518 |  |  |
| -3.380000000000098 | 29.371 |  |  |
| -3.375000000000099 | 29.224 |  |  |
| -3.370000000000099 | 29.079 |  |  |
| -3.365000000000099 | 28.933 |  |  |
| -3.360000000000099 | 28.789 |  |  |
| -3.355000000000099 | 28.646 |  |  |
| -3.350000000000099 | 28.503 |  |  |
| -3.345000000000099 | 28.361 |  |  |
| -3.340000000000099 | 28.219 |  |  |
| -3.335000000000099 | 28.078 |  |  |
| -3.330000000000099 | 27.938 |  |  |
| -3.3250000000001 | 27.799 |  |  |
| -3.3200000000001 | 27.66 |  |  |
| -3.3150000000001 | 27.522 |  |  |
| -3.3100000000001 | 27.385 |  |  |
| -3.3050000000001 | 27.249 |  |  |
| -3.3000000000001 | 27.113 |  |  |
| -3.2950000000001 | 26.977 |  |  |
| -3.2900000000001 | 26.843 |  |  |
| -3.2850000000001 | 26.709 |  |  |
| -3.280000000000101 | 26.576 |  |  |
| -3.275000000000101 | 26.443 |  |  |
| -3.270000000000101 | 26.311 |  |  |
| -3.265000000000101 | 26.18 |  |  |
| -3.260000000000101 | 26.05 |  |  |
| -3.255000000000101 | 25.92 |  |  |
| -3.250000000000101 | 25.79 |  |  |
| -3.245000000000101 | 25.662 |  |  |
| -3.240000000000101 | 25.534 |  |  |
| -3.235000000000102 | 25.406 |  |  |
| -3.230000000000102 | 25.28 |  |  |
| -3.225000000000102 | 25.154 |  |  |
| -3.220000000000102 | 25.028 |  |  |
| -3.215000000000102 | 24.903 |  |  |
| -3.210000000000102 | 24.779 |  |  |
| -3.205000000000102 | 24.656 |  |  |
| -3.200000000000102 | 24.533 |  |  |
| -3.195000000000102 | 24.41 |  |  |
| -3.190000000000103 | 24.288 |  |  |
| -3.185000000000103 | 24.167 |  |  |
| -3.180000000000103 | 24.047 |  |  |
| -3.175000000000103 | 23.927 |  |  |
| -3.170000000000103 | 23.807 |  |  |
| -3.165000000000103 | 23.689 |  |  |
| -3.160000000000103 | 23.571 |  |  |
| -3.155000000000103 | 23.453 |  |  |
| -3.150000000000103 | 23.336 |  |  |
| -3.145000000000103 | 23.22 |  |  |
| -3.140000000000104 | 23.104 |  |  |
| -3.135000000000104 | 22.989 |  |  |
| -3.130000000000104 | 22.874 |  |  |
| -3.125000000000104 | 22.76 |  |  |
| -3.120000000000104 | 22.646 |  |  |
| -3.115000000000104 | 22.533 |  |  |
| -3.110000000000104 | 22.421 |  |  |
| -3.105000000000104 | 22.309 |  |  |
| -3.100000000000104 | 22.198 |  |  |
| -3.095000000000105 | 22.087 |  |  |
| -3.090000000000105 | 21.977 |  |  |
| -3.085000000000105 | 21.867 |  |  |
| -3.080000000000105 | 21.758 |  |  |
| -3.075000000000105 | 21.65 |  |  |
| -3.070000000000105 | 21.542 |  |  |
| -3.065000000000105 | 21.434 |  |  |
| -3.060000000000105 | 21.328 |  |  |
| -3.055000000000105 | 21.221 |  |  |
| -3.050000000000106 | 21.115 |  |  |
| -3.045000000000106 | 21.01 |  |  |
| -3.040000000000106 | 20.905 |  |  |
| -3.035000000000106 | 20.801 |  |  |
| -3.030000000000106 | 20.697 |  |  |
| -3.025000000000106 | 20.594 |  |  |
| -3.020000000000106 | 20.491 |  |  |
| -3.015000000000106 | 20.389 |  |  |
| -3.010000000000106 | 20.287 |  |  |
| -3.005000000000106 | 20.186 |  |  |
| -3.000000000000107 | 20.086 |  |  |
| -2.995000000000107 | 19.985 |  |  |
| -2.990000000000107 | 19.886 |  |  |
| -2.985000000000107 | 19.787 |  |  |
| -2.980000000000107 | 19.688 |  |  |
| -2.975000000000107 | 19.59 |  |  |
| -2.970000000000107 | 19.492 |  |  |
| -2.965000000000107 | 19.395 |  |  |
| -2.960000000000107 | 19.298 |  |  |
| -2.955000000000108 | 19.202 |  |  |
| -2.950000000000108 | 19.106 |  |  |
| -2.945000000000108 | 19.011 |  |  |
| -2.940000000000108 | 18.916 |  |  |
| -2.935000000000108 | 18.822 |  |  |
| -2.930000000000108 | 18.728 |  |  |
| -2.925000000000108 | 18.634 |  |  |
| -2.920000000000108 | 18.541 |  |  |
| -2.915000000000108 | 18.449 |  |  |
| -2.910000000000108 | 18.357 |  |  |
| -2.905000000000109 | 18.265 |  |  |
| -2.900000000000109 | 18.174 |  |  |
| -2.895000000000109 | 18.084 |  |  |
| -2.890000000000109 | 17.993 |  |  |
| -2.885000000000109 | 17.904 |  |  |
| -2.880000000000109 | 17.814 |  |  |
| -2.875000000000109 | 17.725 |  |  |
| -2.870000000000109 | 17.637 |  |  |
| -2.865000000000109 | 17.549 |  |  |
| -2.86000000000011 | 17.462 |  |  |
| -2.85500000000011 | 17.374 |  |  |
| -2.85000000000011 | 17.288 |  |  |
| -2.84500000000011 | 17.202 |  |  |
| -2.84000000000011 | 17.116 |  |  |
| -2.83500000000011 | 17.03 |  |  |
| -2.83000000000011 | 16.945 |  |  |
| -2.82500000000011 | 16.861 |  |  |
| -2.82000000000011 | 16.777 |  |  |
| -2.81500000000011 | 16.693 |  |  |
| -2.810000000000111 | 16.61 |  |  |
| -2.805000000000111 | 16.527 |  |  |
| -2.800000000000111 | 16.445 |  |  |
| -2.795000000000111 | 16.363 |  |  |
| -2.790000000000111 | 16.281 |  |  |
| -2.785000000000111 | 16.2 |  |  |
| -2.780000000000111 | 16.119 |  |  |
| -2.775000000000111 | 16.039 |  |  |
| -2.770000000000111 | 15.959 |  |  |
| -2.765000000000112 | 15.879 |  |  |
| -2.760000000000112 | 15.8 |  |  |
| -2.755000000000112 | 15.721 |  |  |
| -2.750000000000112 | 15.643 |  |  |
| -2.745000000000112 | 15.565 |  |  |
| -2.740000000000112 | 15.487 |  |  |
| -2.735000000000112 | 15.41 |  |  |
| -2.730000000000112 | 15.333 |  |  |
| -2.725000000000112 | 15.256 |  |  |
| -2.720000000000112 | 15.18 |  |  |
| -2.715000000000113 | 15.105 |  |  |
| -2.710000000000113 | 15.029 |  |  |
| -2.705000000000113 | 14.954 |  |  |
| -2.700000000000113 | 14.88 |  |  |
| -2.695000000000113 | 14.806 |  |  |
| -2.690000000000113 | 14.732 |  |  |
| -2.685000000000113 | 14.658 |  |  |
| -2.680000000000113 | 14.585 |  |  |
| -2.675000000000113 | 14.512 |  |  |
| -2.670000000000114 | 14.44 |  |  |
| -2.665000000000114 | 14.368 |  |  |
| -2.660000000000114 | 14.296 |  |  |
| -2.655000000000114 | 14.225 |  |  |
| -2.650000000000114 | 14.154 |  |  |
| -2.645000000000114 | 14.083 |  |  |
| -2.640000000000114 | 14.013 |  |  |
| -2.635000000000114 | 13.943 |  |  |
| -2.630000000000114 | 13.874 |  |  |
| -2.625000000000114 | 13.805 |  |  |
| -2.620000000000115 | 13.736 |  |  |
| -2.615000000000115 | 13.667 |  |  |
| -2.610000000000115 | 13.599 |  |  |
| -2.605000000000115 | 13.531 |  |  |
| -2.600000000000115 | 13.464 |  |  |
| -2.595000000000115 | 13.397 |  |  |
| -2.590000000000115 | 13.33 |  |  |
| -2.585000000000115 | 13.263 |  |  |
| -2.580000000000116 | 13.197 |  |  |
| -2.575000000000116 | 13.131 |  |  |
| -2.570000000000116 | 13.066 |  |  |
| -2.565000000000116 | 13.001 |  |  |
| -2.560000000000116 | 12.936 |  |  |
| -2.555000000000116 | 12.871 |  |  |
| -2.550000000000116 | 12.807 |  |  |
| -2.545000000000116 | 12.743 |  |  |
| -2.540000000000116 | 12.68 |  |  |
| -2.535000000000116 | 12.616 |  |  |
| -2.530000000000117 | 12.554 |  |  |
| -2.525000000000117 | 12.491 |  |  |
| -2.520000000000117 | 12.429 |  |  |
| -2.515000000000117 | 12.367 |  |  |
| -2.510000000000117 | 12.305 |  |  |
| -2.505000000000117 | 12.244 |  |  |
| -2.500000000000117 | 12.182 |  |  |
| -2.495000000000117 | 12.122 |  |  |
| -2.490000000000117 | 12.061 |  |  |
| -2.485000000000118 | 12.001 |  |  |
| -2.480000000000118 | 11.941 |  |  |
| -2.475000000000118 | 11.882 |  |  |
| -2.470000000000118 | 11.822 |  |  |
| -2.465000000000118 | 11.763 |  |  |
| -2.460000000000118 | 11.705 |  |  |
| -2.455000000000118 | 11.646 |  |  |
| -2.450000000000118 | 11.588 |  |  |
| -2.445000000000118 | 11.531 |  |  |
| -2.440000000000118 | 11.473 |  |  |
| -2.435000000000119 | 11.416 |  |  |
| -2.430000000000119 | 11.359 |  |  |
| -2.425000000000119 | 11.302 |  |  |
| -2.420000000000119 | 11.246 |  |  |
| -2.415000000000119 | 11.19 |  |  |
| -2.410000000000119 | 11.134 |  |  |
| -2.405000000000119 | 11.078 |  |  |
| -2.400000000000119 | 11.023 |  |  |
| -2.395000000000119 | 10.968 |  |  |
| -2.39000000000012 | 10.913 |  |  |
| -2.38500000000012 | 10.859 |  |  |
| -2.38000000000012 | 10.805 |  |  |
| -2.37500000000012 | 10.751 |  |  |
| -2.37000000000012 | 10.697 |  |  |
| -2.36500000000012 | 10.644 |  |  |
| -2.36000000000012 | 10.591 |  |  |
| -2.35500000000012 | 10.538 |  |  |
| -2.35000000000012 | 10.486 |  |  |
| -2.34500000000012 | 10.433 |  |  |
| -2.340000000000121 | 10.381 |  |  |
| -2.335000000000121 | 10.329 |  |  |
| -2.330000000000121 | 10.278 |  |  |
| -2.325000000000121 | 10.227 |  |  |
| -2.320000000000121 | 10.176 |  |  |
| -2.315000000000121 | 10.125 |  |  |
| -2.310000000000121 | 10.074 |  |  |
| -2.305000000000121 | 10.024 |  |  |
| -2.300000000000121 | 9.974 |  |  |
| -2.295000000000122 | 9.924 |  |  |
| -2.290000000000122 | 9.875 |  |  |
| -2.285000000000122 | 9.826 |  |  |
| -2.280000000000122 | 9.777 |  |  |
| -2.275000000000122 | 9.728 |  |  |
| -2.270000000000122 | 9.679 |  |  |
| -2.265000000000122 | 9.631 |  |  |
| -2.260000000000122 | 9.583 |  |  |
| -2.255000000000122 | 9.535 |  |  |
| -2.250000000000123 | 9.488 |  |  |
| -2.245000000000123 | 9.44 |  |  |
| -2.240000000000123 | 9.393 |  |  |
| -2.235000000000123 | 9.346 |  |  |
| -2.230000000000123 | 9.3 |  |  |
| -2.225000000000123 | 9.253 |  |  |
| -2.220000000000123 | 9.207 |  |  |
| -2.215000000000123 | 9.161 |  |  |
| -2.210000000000123 | 9.116 |  |  |
| -2.205000000000124 | 9.07 |  |  |
| -2.200000000000124 | 9.025 |  |  |
| -2.195000000000124 | 8.98 |  |  |
| -2.190000000000124 | 8.935 |  |  |
| -2.185000000000124 | 8.891 |  |  |
| -2.180000000000124 | 8.846 |  |  |
| -2.175000000000124 | 8.802 |  |  |
| -2.170000000000124 | 8.758 |  |  |
| -2.165000000000124 | 8.715 |  |  |
| -2.160000000000124 | 8.671 |  |  |
| -2.155000000000125 | 8.628 |  |  |
| -2.150000000000125 | 8.585 |  |  |
| -2.145000000000125 | 8.542 |  |  |
| -2.140000000000125 | 8.499 |  |  |
| -2.135000000000125 | 8.457 |  |  |
| -2.130000000000125 | 8.415 |  |  |
| -2.125000000000125 | 8.373 |  |  |
| -2.120000000000125 | 8.331 |  |  |
| -2.115000000000125 | 8.29 |  |  |
| -2.110000000000126 | 8.248 |  |  |
| -2.105000000000126 | 8.207 |  |  |
| -2.100000000000126 | 8.166 |  |  |
| -2.095000000000126 | 8.125 |  |  |
| -2.090000000000126 | 8.085 |  |  |
| -2.085000000000126 | 8.045 |  |  |
| -2.080000000000126 | 8.004 |  |  |
| -2.075000000000126 | 7.965 |  |  |
| -2.070000000000126 | 7.925 |  |  |
| -2.065000000000126 | 7.885 |  |  |
| -2.060000000000127 | 7.846 |  |  |
| -2.055000000000127 | 7.807 |  |  |
| -2.050000000000127 | 7.768 |  |  |
| -2.045000000000127 | 7.729 |  |  |
| -2.040000000000127 | 7.691 |  |  |
| -2.035000000000127 | 7.652 |  |  |
| -2.030000000000127 | 7.614 |  |  |
| -2.025000000000127 | 7.576 |  |  |
| -2.020000000000127 | 7.538 |  |  |
| -2.015000000000128 | 7.501 |  |  |
| -2.010000000000128 | 7.463 |  |  |
| -2.005000000000128 | 7.426 |  |  |
| -2.000000000000128 | 7.389 |  |  |
| -1.995000000000128 | 7.352 |  |  |
| -1.990000000000128 | 7.316 |  |  |
| -1.985000000000128 | 7.279 |  |  |
| -1.980000000000128 | 7.243 |  |  |
| -1.975000000000128 | 7.207 |  |  |
| -1.970000000000129 | 7.171 |  |  |
| -1.965000000000129 | 7.135 |  |  |
| -1.960000000000129 | 7.099 |  |  |
| -1.955000000000129 | 7.064 |  |  |
| -1.950000000000129 | 7.029 |  |  |
| -1.945000000000129 | 6.994 |  |  |
| -1.940000000000129 | 6.959 |  |  |
| -1.935000000000129 | 6.924 |  |  |
| -1.930000000000129 | 6.89 |  |  |
| -1.925000000000129 | 6.855 |  |  |
| -1.92000000000013 | 6.821 |  |  |
| -1.91500000000013 | 6.787 |  |  |
| -1.91000000000013 | 6.753 |  |  |
| -1.90500000000013 | 6.719 |  |  |
| -1.90000000000013 | 6.686 |  |  |
| -1.89500000000013 | 6.653 |  |  |
| -1.89000000000013 | 6.619 |  |  |
| -1.88500000000013 | 6.586 |  |  |
| -1.88000000000013 | 6.554 |  |  |
| -1.875000000000131 | 6.521 |  |  |
| -1.870000000000131 | 6.488 |  |  |
| -1.865000000000131 | 6.456 |  |  |
| -1.860000000000131 | 6.424 |  |  |
| -1.855000000000131 | 6.392 |  |  |
| -1.850000000000131 | 6.36 |  |  |
| -1.845000000000131 | 6.328 |  |  |
| -1.840000000000131 | 6.297 |  |  |
| -1.835000000000131 | 6.265 |  |  |
| -1.830000000000131 | 6.234 |  |  |
| -1.825000000000132 | 6.203 |  |  |
| -1.820000000000132 | 6.172 |  |  |
| -1.815000000000132 | 6.141 |  |  |
| -1.810000000000132 | 6.11 |  |  |
| -1.805000000000132 | 6.08 |  |  |
| -1.800000000000132 | 6.05 |  |  |
| -1.795000000000132 | 6.019 |  |  |
| -1.790000000000132 | 5.989 |  |  |
| -1.785000000000132 | 5.96 |  |  |
| -1.780000000000133 | 5.93 |  |  |
| -1.775000000000133 | 5.9 |  |  |
| -1.770000000000133 | 5.871 |  |  |
| -1.765000000000133 | 5.842 |  |  |
| -1.760000000000133 | 5.812 |  |  |
| -1.755000000000133 | 5.783 |  |  |
| -1.750000000000133 | 5.755 |  |  |
| -1.745000000000133 | 5.726 |  |  |
| -1.740000000000133 | 5.697 |  |  |
| -1.735000000000133 | 5.669 |  |  |
| -1.730000000000134 | 5.641 |  |  |
| -1.725000000000134 | 5.613 |  |  |
| -1.720000000000134 | 5.585 |  |  |
| -1.715000000000134 | 5.557 |  |  |
| -1.710000000000134 | 5.529 |  |  |
| -1.705000000000134 | 5.501 |  |  |
| -1.700000000000134 | 5.474 |  |  |
| -1.695000000000134 | 5.447 |  |  |
| -1.690000000000134 | 5.419 |  |  |
| -1.685000000000135 | 5.392 |  |  |
| -1.680000000000135 | 5.366 |  |  |
| -1.675000000000135 | 5.339 |  |  |
| -1.670000000000135 | 5.312 |  |  |
| -1.665000000000135 | 5.286 |  |  |
| -1.660000000000135 | 5.259 |  |  |
| -1.655000000000135 | 5.233 |  |  |
| -1.650000000000135 | 5.207 |  |  |
| -1.645000000000135 | 5.181 |  |  |
| -1.640000000000135 | 5.155 |  |  |
| -1.635000000000136 | 5.129 |  |  |
| -1.630000000000136 | 5.104 |  |  |
| -1.625000000000136 | 5.078 |  |  |
| -1.620000000000136 | 5.053 |  |  |
| -1.615000000000136 | 5.028 |  |  |
| -1.610000000000136 | 5.003 |  |  |
| -1.605000000000136 | 4.978 |  |  |
| -1.600000000000136 | 4.953 |  |  |
| -1.595000000000137 | 4.928 |  |  |
| -1.590000000000137 | 4.904 |  |  |
| -1.585000000000137 | 4.879 |  |  |
| -1.580000000000137 | 4.855 |  |  |
| -1.575000000000137 | 4.831 |  |  |
| -1.570000000000137 | 4.807 |  |  |
| -1.565000000000137 | 4.783 |  |  |
| -1.560000000000137 | 4.759 |  |  |
| -1.555000000000137 | 4.735 |  |  |
| -1.550000000000137 | 4.711 |  |  |
| -1.545000000000138 | 4.688 |  |  |
| -1.540000000000138 | 4.665 |  |  |
| -1.535000000000138 | 4.641 |  |  |
| -1.530000000000138 | 4.618 |  |  |
| -1.525000000000138 | 4.595 |  |  |
| -1.520000000000138 | 4.572 |  |  |
| -1.515000000000138 | 4.549 |  |  |
| -1.510000000000138 | 4.527 |  |  |
| -1.505000000000138 | 4.504 |  |  |
| -1.500000000000139 | 4.482 |  |  |
| -1.495000000000139 | 4.459 |  |  |
| -1.490000000000139 | 4.437 |  |  |
| -1.485000000000139 | 4.415 |  |  |
| -1.480000000000139 | 4.393 |  |  |
| -1.475000000000139 | 4.371 |  |  |
| -1.470000000000139 | 4.349 |  |  |
| -1.465000000000139 | 4.328 |  |  |
| -1.460000000000139 | 4.306 |  |  |
| -1.455000000000139 | 4.284 |  |  |
| -1.45000000000014 | 4.263 |  |  |
| -1.44500000000014 | 4.242 |  |  |
| -1.44000000000014 | 4.221 |  |  |
| -1.43500000000014 | 4.2 |  |  |
| -1.43000000000014 | 4.179 |  |  |
| -1.42500000000014 | 4.158 |  |  |
| -1.42000000000014 | 4.137 |  |  |
| -1.41500000000014 | 4.116 |  |  |
| -1.41000000000014 | 4.096 |  |  |
| -1.405000000000141 | 4.076 |  |  |
| -1.400000000000141 | 4.055 |  |  |
| -1.395000000000141 | 4.035 |  |  |
| -1.390000000000141 | 4.015 |  |  |
| -1.385000000000141 | 3.995 |  |  |
| -1.380000000000141 | 3.975 |  |  |
| -1.375000000000141 | 3.955 |  |  |
| -1.370000000000141 | 3.935 |  |  |
| -1.365000000000141 | 3.916 |  |  |
| -1.360000000000141 | 3.896 |  |  |
| -1.355000000000142 | 3.877 |  |  |
| -1.350000000000142 | 3.857 |  |  |
| -1.345000000000142 | 3.838 |  |  |
| -1.340000000000142 | 3.819 |  |  |
| -1.335000000000142 | 3.8 |  |  |
| -1.330000000000142 | 3.781 |  |  |
| -1.325000000000142 | 3.762 |  |  |
| -1.320000000000142 | 3.743 |  |  |
| -1.315000000000142 | 3.725 |  |  |
| -1.310000000000143 | 3.706 |  |  |
| -1.305000000000143 | 3.688 |  |  |
| -1.300000000000143 | 3.669 |  |  |
| -1.295000000000143 | 3.651 |  |  |
| -1.290000000000143 | 3.633 |  |  |
| -1.285000000000143 | 3.615 |  |  |
| -1.280000000000143 | 3.597 |  |  |
| -1.275000000000143 | 3.579 |  |  |
| -1.270000000000143 | 3.561 |  |  |
| -1.265000000000144 | 3.543 |  |  |
| -1.260000000000144 | 3.525 |  |  |
| -1.255000000000144 | 3.508 |  |  |
| -1.250000000000144 | 3.49 |  |  |
| -1.245000000000144 | 3.473 |  |  |
| -1.240000000000144 | 3.456 |  |  |
| -1.235000000000144 | 3.438 |  |  |
| -1.230000000000144 | 3.421 |  |  |
| -1.225000000000144 | 3.404 |  |  |
| -1.220000000000145 | 3.387 |  |  |
| -1.215000000000145 | 3.37 |  |  |
| -1.210000000000145 | 3.353 |  |  |
| -1.205000000000145 | 3.337 |  |  |
| -1.200000000000145 | 3.32 |  |  |
| -1.195000000000145 | 3.304 |  |  |
| -1.190000000000145 | 3.287 |  |  |
| -1.185000000000145 | 3.271 |  |  |
| -1.180000000000145 | 3.254 |  |  |
| -1.175000000000145 | 3.238 |  |  |
| -1.170000000000146 | 3.222 |  |  |
| -1.165000000000146 | 3.206 |  |  |
| -1.160000000000146 | 3.19 |  |  |
| -1.155000000000146 | 3.174 |  |  |
| -1.150000000000146 | 3.158 |  |  |
| -1.145000000000146 | 3.142 |  |  |
| -1.140000000000146 | 3.127 |  |  |
| -1.135000000000146 | 3.111 |  |  |
| -1.130000000000146 | 3.096 |  |  |
| -1.125000000000147 | 3.08 |  |  |
| -1.120000000000147 | 3.065 |  |  |
| -1.115000000000147 | 3.05 |  |  |
| -1.110000000000147 | 3.034 |  |  |
| -1.105000000000147 | 3.019 |  |  |
| -1.100000000000147 | 3.004 |  |  |
| -1.095000000000147 | 2.989 |  |  |
| -1.090000000000147 | 2.974 |  |  |
| -1.085000000000147 | 2.959 |  |  |
| -1.080000000000147 | 2.945 |  |  |
| -1.075000000000148 | 2.93 |  |  |
| -1.070000000000148 | 2.915 |  |  |
| -1.065000000000148 | 2.901 |  |  |
| -1.060000000000148 | 2.886 |  |  |
| -1.055000000000148 | 2.872 |  |  |
| -1.050000000000148 | 2.858 |  |  |
| -1.045000000000148 | 2.843 |  |  |
| -1.040000000000148 | 2.829 |  |  |
| -1.035000000000148 | 2.815 |  |  |
| -1.030000000000149 | 2.801 |  |  |
| -1.025000000000149 | 2.787 |  |  |
| -1.020000000000149 | 2.773 |  |  |
| -1.015000000000149 | 2.759 |  |  |
| -1.010000000000149 | 2.746 |  |  |
| -1.005000000000149 | 2.732 |  |  |
| -1.000000000000149 | 2.718 |  |  |
| -0.995000000000149 | 2.705 |  |  |
| -0.990000000000149 | 2.691 |  |  |
| -0.985000000000149 | 2.678 |  |  |
| -0.980000000000149 | 2.664 |  |  |
| -0.975000000000149 | 2.651 |  |  |
| -0.970000000000149 | 2.638 |  |  |
| -0.965000000000149 | 2.625 |  |  |
| -0.960000000000149 | 2.612 |  |  |
| -0.955000000000149 | 2.599 |  |  |
| -0.950000000000149 | 2.586 |  |  |
| -0.945000000000149 | 2.573 |  |  |
| -0.940000000000149 | 2.56 |  |  |
| -0.935000000000149 | 2.547 |  |  |
| -0.930000000000149 | 2.535 |  |  |
| -0.925000000000149 | 2.522 |  |  |
| -0.920000000000149 | 2.509 |  |  |
| -0.915000000000149 | 2.497 |  |  |
| -0.910000000000149 | 2.484 |  |  |
| -0.905000000000149 | 2.472 |  |  |
| -0.900000000000149 | 2.46 |  |  |
| -0.895000000000149 | 2.447 |  |  |
| -0.890000000000149 | 2.435 |  |  |
| -0.885000000000149 | 2.423 |  |  |
| -0.880000000000149 | 2.411 |  |  |
| -0.875000000000149 | 2.399 |  |  |
| -0.870000000000149 | 2.387 |  |  |
| -0.865000000000149 | 2.375 |  |  |
| -0.860000000000149 | 2.363 |  |  |
| -0.855000000000149 | 2.351 |  |  |
| -0.850000000000149 | 2.34 |  |  |
| -0.845000000000149 | 2.328 |  |  |
| -0.840000000000149 | 2.316 |  |  |
| -0.835000000000149 | 2.305 |  |  |
| -0.830000000000149 | 2.293 |  |  |
| -0.825000000000149 | 2.282 |  |  |
| -0.820000000000149 | 2.27 |  |  |
| -0.815000000000149 | 2.259 |  |  |
| -0.810000000000149 | 2.248 |  |  |
| -0.805000000000149 | 2.237 |  |  |
| -0.800000000000149 | 2.226 |  |  |
| -0.795000000000149 | 2.214 |  |  |
| -0.790000000000149 | 2.203 |  |  |
| -0.785000000000149 | 2.192 |  |  |
| -0.780000000000149 | 2.181 |  |  |
| -0.775000000000149 | 2.171 |  |  |
| -0.770000000000149 | 2.16 |  |  |
| -0.765000000000149 | 2.149 |  |  |
| -0.760000000000149 | 2.138 |  |  |
| -0.755000000000149 | 2.128 |  |  |
| -0.750000000000149 | 2.117 |  |  |
| -0.745000000000149 | 2.106 |  |  |
| -0.740000000000149 | 2.096 |  |  |
| -0.735000000000149 | 2.085 |  |  |
| -0.730000000000149 | 2.075 |  |  |
| -0.725000000000149 | 2.065 |  |  |
| -0.720000000000149 | 2.054 |  |  |
| -0.715000000000149 | 2.044 |  |  |
| -0.710000000000149 | 2.034 |  |  |
| -0.705000000000149 | 2.024 |  |  |
| -0.700000000000149 | 2.014 |  |  |
| -0.695000000000149 | 2.004 |  |  |
| -0.690000000000149 | 1.994 |  |  |
| -0.685000000000149 | 1.984 |  |  |
| -0.680000000000149 | 1.974 |  |  |
| -0.675000000000149 | 1.964 |  |  |
| -0.670000000000149 | 1.954 |  |  |
| -0.665000000000149 | 1.944 |  |  |
| -0.660000000000149 | 1.935 |  |  |
| -0.655000000000149 | 1.925 |  |  |
| -0.650000000000149 | 1.916 |  |  |
| -0.645000000000149 | 1.906 |  |  |
| -0.640000000000149 | 1.896 |  |  |
| -0.635000000000149 | 1.887 |  |  |
| -0.630000000000149 | 1.878 |  |  |
| -0.625000000000149 | 1.868 |  |  |
| -0.620000000000149 | 1.859 |  |  |
| -0.615000000000149 | 1.85 |  |  |
| -0.610000000000149 | 1.84 |  |  |
| -0.605000000000149 | 1.831 |  |  |
| -0.600000000000149 | 1.822 |  |  |
| -0.595000000000149 | 1.813 |  |  |
| -0.590000000000149 | 1.804 |  |  |
| -0.585000000000149 | 1.795 |  |  |
| -0.580000000000149 | 1.786 |  |  |
| -0.575000000000149 | 1.777 |  |  |
| -0.570000000000149 | 1.768 |  |  |
| -0.565000000000149 | 1.759 |  |  |
| -0.560000000000149 | 1.751 |  |  |
| -0.555000000000149 | 1.742 |  |  |
| -0.550000000000149 | 1.733 |  |  |
| -0.545000000000149 | 1.725 |  |  |
| -0.540000000000149 | 1.716 |  |  |
| -0.535000000000149 | 1.707 |  |  |
| -0.530000000000149 | 1.699 |  |  |
| -0.525000000000149 | 1.69 |  |  |
| -0.520000000000149 | 1.682 |  |  |
| -0.515000000000149 | 1.674 |  |  |
| -0.510000000000149 | 1.665 |  |  |
| -0.505000000000149 | 1.657 |  |  |
| -0.500000000000149 | 1.649 |  |  |
| -0.495000000000149 | 1.64 |  |  |
| -0.490000000000149 | 1.632 |  |  |
| -0.485000000000149 | 1.624 |  |  |
| -0.480000000000149 | 1.616 |  |  |
| -0.475000000000149 | 1.608 |  |  |
| -0.470000000000149 | 1.6 |  |  |
| -0.465000000000149 | 1.592 |  |  |
| -0.460000000000149 | 1.584 |  |  |
| -0.455000000000149 | 1.576 |  |  |
| -0.450000000000149 | 1.568 |  |  |
| -0.445000000000149 | 1.56 |  |  |
| -0.440000000000149 | 1.553 |  |  |
| -0.435000000000149 | 1.545 |  |  |
| -0.430000000000149 | 1.537 |  |  |
| -0.425000000000149 | 1.53 |  |  |
| -0.420000000000149 | 1.522 |  |  |
| -0.415000000000149 | 1.514 |  |  |
| -0.410000000000149 | 1.507 |  |  |
| -0.405000000000149 | 1.499 |  |  |
| -0.400000000000149 | 1.492 |  |  |
| -0.395000000000149 | 1.484 |  |  |
| -0.390000000000149 | 1.477 |  |  |
| -0.385000000000149 | 1.47 |  |  |
| -0.380000000000149 | 1.462 |  |  |
| -0.375000000000149 | 1.455 |  |  |
| -0.370000000000149 | 1.448 |  |  |
| -0.365000000000149 | 1.441 |  |  |
| -0.360000000000149 | 1.433 |  |  |
| -0.355000000000149 | 1.426 |  |  |
| -0.350000000000149 | 1.419 |  |  |
| -0.345000000000149 | 1.412 |  |  |
| -0.340000000000149 | 1.405 |  |  |
| -0.335000000000149 | 1.398 |  |  |
| -0.330000000000149 | 1.391 |  |  |
| -0.325000000000149 | 1.384 |  |  |
| -0.320000000000149 | 1.377 |  |  |
| -0.315000000000149 | 1.37 |  |  |
| -0.310000000000149 | 1.363 |  |  |
| -0.305000000000149 | 1.357 |  |  |
| -0.300000000000149 | 1.35 |  |  |
| -0.295000000000149 | 1.343 |  |  |
| -0.290000000000149 | 1.336 |  |  |
| -0.285000000000149 | 1.33 |  |  |
| -0.280000000000149 | 1.323 |  |  |
| -0.275000000000149 | 1.317 |  |  |
| -0.270000000000149 | 1.31 |  |  |
| -0.265000000000149 | 1.303 |  |  |
| -0.260000000000149 | 1.297 |  |  |
| -0.255000000000149 | 1.29 |  |  |
| -0.250000000000149 | 1.284 |  |  |
| -0.245000000000149 | 1.278 |  |  |
| -0.240000000000149 | 1.271 |  |  |
| -0.235000000000149 | 1.265 |  |  |
| -0.230000000000149 | 1.259 |  |  |
| -0.225000000000149 | 1.252 |  |  |
| -0.220000000000149 | 1.246 |  |  |
| -0.215000000000149 | 1.24 |  |  |
| -0.210000000000148 | 1.234 |  |  |
| -0.205000000000148 | 1.228 |  |  |
| -0.200000000000148 | 1.221 |  |  |
| -0.195000000000148 | 1.215 |  |  |
| -0.190000000000148 | 1.209 |  |  |
| -0.185000000000148 | 1.203 |  |  |
| -0.180000000000148 | 1.197 |  |  |
| -0.175000000000148 | 1.191 |  |  |
| -0.170000000000148 | 1.185 |  |  |
| -0.165000000000148 | 1.179 |  |  |
| -0.160000000000148 | 1.174 |  |  |
| -0.155000000000148 | 1.168 |  |  |
| -0.150000000000148 | 1.162 |  |  |
| -0.145000000000148 | 1.156 |  |  |
| -0.140000000000148 | 1.15 |  |  |
| -0.135000000000148 | 1.145 |  |  |
| -0.130000000000148 | 1.139 |  |  |
| -0.125000000000148 | 1.133 |  |  |
| -0.120000000000148 | 1.127 |  |  |
| -0.115000000000148 | 1.122 |  |  |
| -0.110000000000148 | 1.116 |  |  |
| -0.105000000000148 | 1.111 |  |  |
| -0.100000000000148 | 1.105 |  |  |
| -0.0950000000001484 | 1.1 |  |  |
| -0.0900000000001484 | 1.094 |  |  |
| -0.0850000000001484 | 1.089 |  |  |
| -0.0800000000001484 | 1.083 |  |  |
| -0.0750000000001484 | 1.078 |  |  |
| -0.0700000000001484 | 1.073 |  |  |
| -0.0650000000001484 | 1.067 |  |  |
| -0.0600000000001484 | 1.062 |  |  |
| -0.0550000000001484 | 1.057 |  |  |
| -0.0500000000001484 | 1.051 |  |  |
| -0.0450000000001484 | 1.046 |  |  |
| -0.0400000000001484 | 1.041 |  |  |
| -0.0350000000001484 | 1.036 |  |  |
| -0.0300000000001484 | 1.03 |  |  |
| -0.0250000000001484 | 1.025 |  |  |
| -0.0200000000001484 | 1.02 |  |  |
| -0.0150000000001484 | 1.015 |  |  |
| -0.0100000000001484 | 1.01 |  |  |
| -0.00500000000014839 | 1.005 |  |  |
| -1.48393450305484e-13 | 1 |  |  |
| 0.00499999999985161 | 0.995 |  |  |
| 0.0099999999998516 | 0.99 |  |  |
| 0.0149999999998516 | 0.985 |  |  |
| 0.0199999999998516 | 0.98 |  |  |
| 0.0249999999998516 | 0.975 |  |  |
| 0.0299999999998516 | 0.97 |  |  |
| 0.0349999999998516 | 0.966 |  |  |
| 0.0399999999998516 | 0.961 |  |  |
| 0.0449999999998516 | 0.956 |  |  |
| 0.0499999999998516 | 0.951 |  |  |
| 0.0549999999998516 | 0.946 |  |  |
| 0.0599999999998516 | 0.942 |  |  |
| 0.0649999999998516 | 0.937 |  |  |
| 0.0699999999998516 | 0.932 |  |  |
| 0.0749999999998516 | 0.928 |  |  |
| 0.0799999999998516 | 0.923 |  |  |
| 0.0849999999998516 | 0.919 |  |  |
| 0.0899999999998516 | 0.914 |  |  |
| 0.0949999999998516 | 0.909 |  |  |
| 0.0999999999998516 | 0.905 |  |  |
| 0.104999999999852 | 0.9 |  |  |
| 0.109999999999852 | 0.896 |  |  |
| 0.114999999999852 | 0.891 |  |  |
| 0.119999999999852 | 0.887 |  |  |
| 0.124999999999852 | 0.882 |  |  |
| 0.129999999999852 | 0.878 |  |  |
| 0.134999999999852 | 0.874 |  |  |
| 0.139999999999852 | 0.869 |  |  |
| 0.144999999999852 | 0.865 |  |  |
| 0.149999999999852 | 0.861 |  |  |
| 0.154999999999852 | 0.856 |  |  |
| 0.159999999999852 | 0.852 |  |  |
| 0.164999999999852 | 0.848 |  |  |
| 0.169999999999852 | 0.844 |  |  |
| 0.174999999999852 | 0.839 |  |  |
| 0.179999999999852 | 0.835 |  |  |
| 0.184999999999852 | 0.831 |  |  |
| 0.189999999999852 | 0.827 |  |  |
| 0.194999999999852 | 0.823 |  |  |
| 0.199999999999852 | 0.819 |  |  |
| 0.204999999999852 | 0.815 |  |  |
| 0.209999999999852 | 0.811 |  |  |
| 0.214999999999852 | 0.807 |  |  |
| 0.219999999999852 | 0.803 |  |  |
| 0.224999999999852 | 0.799 |  |  |
| 0.229999999999852 | 0.795 |  |  |
| 0.234999999999852 | 0.791 |  |  |
| 0.239999999999852 | 0.787 |  |  |
| 0.244999999999852 | 0.783 |  |  |
| 0.249999999999852 | 0.779 |  |  |
| 0.254999999999852 | 0.775 |  |  |
| 0.259999999999852 | 0.771 |  |  |
| 0.264999999999852 | 0.767 |  |  |
| 0.269999999999852 | 0.763 |  |  |
| 0.274999999999852 | 0.76 |  |  |
| 0.279999999999852 | 0.756 |  |  |
| 0.284999999999852 | 0.752 |  |  |
| 0.289999999999852 | 0.748 |  |  |
| 0.294999999999852 | 0.745 |  |  |
| 0.299999999999852 | 0.741 |  |  |
| 0.304999999999852 | 0.737 |  |  |
| 0.309999999999852 | 0.733 |  |  |
| 0.314999999999852 | 0.73 |  |  |
| 0.319999999999852 | 0.726 |  |  |
| 0.324999999999852 | 0.723 |  |  |
| 0.329999999999852 | 0.719 |  |  |
| 0.334999999999852 | 0.715 |  |  |
| 0.339999999999852 | 0.712 |  |  |
| 0.344999999999852 | 0.708 |  |  |
| 0.349999999999852 | 0.705 |  |  |
| 0.354999999999852 | 0.701 |  |  |
| 0.359999999999852 | 0.698 |  |  |
| 0.364999999999852 | 0.694 |  |  |
| 0.369999999999852 | 0.691 |  |  |
| 0.374999999999852 | 0.687 |  |  |
| 0.379999999999852 | 0.684 |  |  |
| 0.384999999999852 | 0.68 |  |  |
| 0.389999999999852 | 0.677 |  |  |
| 0.394999999999852 | 0.674 |  |  |
| 0.399999999999852 | 0.67 |  |  |
| 0.404999999999852 | 0.667 |  |  |
| 0.409999999999852 | 0.664 |  |  |
| 0.414999999999852 | 0.66 |  |  |
| 0.419999999999852 | 0.657 |  |  |
| 0.424999999999852 | 0.654 |  |  |
| 0.429999999999852 | 0.651 |  |  |
| 0.434999999999852 | 0.647 |  |  |
| 0.439999999999852 | 0.644 |  |  |
| 0.444999999999852 | 0.641 |  |  |
| 0.449999999999852 | 0.638 |  |  |
| 0.454999999999852 | 0.634 |  |  |
| 0.459999999999852 | 0.631 |  |  |
| 0.464999999999852 | 0.628 |  |  |
| 0.469999999999852 | 0.625 |  |  |
| 0.474999999999852 | 0.622 |  |  |
| 0.479999999999852 | 0.619 |  |  |
| 0.484999999999852 | 0.616 |  |  |
| 0.489999999999852 | 0.613 |  |  |
| 0.494999999999852 | 0.61 |  |  |
| 0.499999999999852 | 0.607 |  |  |
| 0.504999999999852 | 0.604 |  |  |
| 0.509999999999852 | 0.6 |  |  |
| 0.514999999999852 | 0.598 |  |  |
| 0.519999999999852 | 0.595 |  |  |
| 0.524999999999852 | 0.592 |  |  |
| 0.529999999999852 | 0.589 |  |  |
| 0.534999999999852 | 0.586 |  |  |
| 0.539999999999852 | 0.583 |  |  |
| 0.544999999999852 | 0.58 |  |  |
| 0.549999999999852 | 0.577 |  |  |
| 0.554999999999852 | 0.574 |  |  |
| 0.559999999999852 | 0.571 |  |  |
| 0.564999999999852 | 0.568 |  |  |
| 0.569999999999852 | 0.566 |  |  |
| 0.574999999999852 | 0.563 |  |  |
| 0.579999999999852 | 0.56 |  |  |
| 0.584999999999852 | 0.557 |  |  |
| 0.589999999999852 | 0.554 |  |  |
| 0.594999999999852 | 0.552 |  |  |
| 0.599999999999852 | 0.549 |  |  |
| 0.604999999999852 | 0.546 |  |  |
| 0.609999999999852 | 0.543 |  |  |
| 0.614999999999852 | 0.541 |  |  |
| 0.619999999999852 | 0.538 |  |  |
| 0.624999999999852 | 0.535 |  |  |
| 0.629999999999852 | 0.533 |  |  |
| 0.634999999999852 | 0.53 |  |  |
| 0.639999999999852 | 0.527 |  |  |
| 0.644999999999852 | 0.525 |  |  |
| 0.649999999999852 | 0.522 |  |  |
| 0.654999999999852 | 0.519 |  |  |
| 0.659999999999852 | 0.517 |  |  |
| 0.664999999999852 | 0.514 |  |  |
| 0.669999999999852 | 0.512 |  |  |
| 0.674999999999852 | 0.509 |  |  |
| 0.679999999999852 | 0.507 |  |  |
| 0.684999999999852 | 0.504 |  |  |
| 0.689999999999852 | 0.502 |  |  |
| 0.694999999999852 | 0.499 |  |  |
| 0.699999999999852 | 0.497 |  |  |
| 0.704999999999852 | 0.494 |  |  |
| 0.709999999999852 | 0.492 |  |  |
| 0.714999999999852 | 0.489 |  |  |
| 0.719999999999852 | 0.487 |  |  |
| 0.724999999999852 | 0.484 |  |  |
| 0.729999999999852 | 0.482 |  |  |
| 0.734999999999852 | 0.48 |  |  |
| 0.739999999999852 | 0.477 |  |  |
| 0.744999999999852 | 0.475 |  |  |
| 0.749999999999852 | 0.472 |  |  |
| 0.754999999999852 | 0.47 |  |  |
| 0.759999999999852 | 0.468 |  |  |
| 0.764999999999852 | 0.465 |  |  |
| 0.769999999999852 | 0.463 |  |  |
| 0.774999999999852 | 0.461 |  |  |
| 0.779999999999852 | 0.458 |  |  |
| 0.784999999999852 | 0.456 |  |  |
| 0.789999999999852 | 0.454 |  |  |
| 0.794999999999852 | 0.452 |  |  |
| 0.799999999999852 | 0.449 |  |  |
| 0.804999999999852 | 0.447 |  |  |
| 0.809999999999852 | 0.445 |  |  |
| 0.814999999999852 | 0.443 |  |  |
| 0.819999999999852 | 0.44 |  |  |
| 0.824999999999852 | 0.438 |  |  |
| 0.829999999999852 | 0.436 |  |  |
| 0.834999999999852 | 0.434 |  |  |
| 0.839999999999852 | 0.432 |  |  |
| 0.844999999999852 | 0.43 |  |  |
| 0.849999999999852 | 0.427 |  |  |
| 0.854999999999852 | 0.425 |  |  |
| 0.859999999999852 | 0.423 |  |  |
| 0.864999999999852 | 0.421 |  |  |
| 0.869999999999852 | 0.419 |  |  |
| 0.874999999999852 | 0.417 |  |  |
| 0.879999999999852 | 0.415 |  |  |
| 0.884999999999852 | 0.413 |  |  |
| 0.889999999999852 | 0.411 |  |  |
| 0.894999999999852 | 0.409 |  |  |
| 0.899999999999852 | 0.407 |  |  |
| 0.904999999999852 | 0.405 |  |  |
| 0.909999999999852 | 0.403 |  |  |
| 0.914999999999852 | 0.401 |  |  |
| 0.919999999999852 | 0.399 |  |  |
| 0.924999999999852 | 0.397 |  |  |
| 0.929999999999852 | 0.395 |  |  |
| 0.934999999999852 | 0.393 |  |  |
| 0.939999999999852 | 0.391 |  |  |
| 0.944999999999852 | 0.389 |  |  |
| 0.949999999999852 | 0.387 |  |  |
| 0.954999999999852 | 0.385 |  |  |
| 0.959999999999852 | 0.383 |  |  |
| 0.964999999999852 | 0.381 |  |  |
| 0.969999999999852 | 0.379 |  |  |
| 0.974999999999852 | 0.377 |  |  |
| 0.979999999999852 | 0.375 |  |  |
| 0.984999999999852 | 0.373 |  |  |
| 0.989999999999852 | 0.372 |  |  |
| 0.994999999999852 | 0.37 |  |  |
| 0.999999999999852 | 0.368 |  |  |
| 1.004999999999852 | 0.366 |  |  |
| 1.009999999999852 | 0.364 |  |  |
| 1.014999999999852 | 0.362 |  |  |
| 1.019999999999852 | 0.361 |  |  |
| 1.024999999999852 | 0.359 |  |  |
| 1.029999999999852 | 0.357 |  |  |
| 1.034999999999852 | 0.355 |  |  |
| 1.039999999999851 | 0.353 |  |  |
| 1.044999999999851 | 0.352 |  |  |
| 1.049999999999851 | 0.35 |  |  |
| 1.054999999999851 | 0.348 |  |  |
| 1.059999999999851 | 0.346 |  |  |
| 1.064999999999851 | 0.345 |  |  |
| 1.069999999999851 | 0.343 |  |  |
| 1.074999999999851 | 0.341 |  |  |
| 1.079999999999851 | 0.34 |  |  |
| 1.084999999999851 | 0.338 |  |  |
| 1.08999999999985 | 0.336 |  |  |
| 1.09499999999985 | 0.335 |  |  |
| 1.09999999999985 | 0.333 |  |  |
| 1.10499999999985 | 0.331 |  |  |
| 1.10999999999985 | 0.33 |  |  |
| 1.11499999999985 | 0.328 |  |  |
| 1.11999999999985 | 0.326 |  |  |
| 1.12499999999985 | 0.325 |  |  |
| 1.12999999999985 | 0.323 |  |  |
| 1.134999999999849 | 0.321 |  |  |
| 1.139999999999849 | 0.32 |  |  |
| 1.144999999999849 | 0.318 |  |  |
| 1.149999999999849 | 0.317 |  |  |
| 1.15499999999985 | 0.315 |  |  |
| 1.159999999999849 | 0.313 |  |  |
| 1.164999999999849 | 0.312 |  |  |
| 1.169999999999849 | 0.31 |  |  |
| 1.174999999999849 | 0.309 |  |  |
| 1.179999999999848 | 0.307 |  |  |
| 1.184999999999848 | 0.306 |  |  |
| 1.189999999999848 | 0.304 |  |  |
| 1.194999999999848 | 0.303 |  |  |
| 1.199999999999848 | 0.301 |  |  |
| 1.204999999999848 | 0.3 |  |  |
| 1.209999999999848 | 0.298 |  |  |
| 1.214999999999848 | 0.297 |  |  |
| 1.219999999999848 | 0.295 |  |  |
| 1.224999999999848 | 0.294 |  |  |
| 1.229999999999847 | 0.292 |  |  |
| 1.234999999999847 | 0.291 |  |  |
| 1.239999999999847 | 0.289 |  |  |
| 1.244999999999847 | 0.288 |  |  |
| 1.249999999999847 | 0.287 |  |  |
| 1.254999999999847 | 0.285 |  |  |
| 1.259999999999847 | 0.284 |  |  |
| 1.264999999999847 | 0.282 |  |  |
| 1.269999999999847 | 0.281 |  |  |
| 1.274999999999846 | 0.279 |  |  |
| 1.279999999999846 | 0.278 |  |  |
| 1.284999999999846 | 0.277 |  |  |
| 1.289999999999846 | 0.275 |  |  |
| 1.294999999999846 | 0.274 |  |  |
| 1.299999999999846 | 0.273 |  |  |
| 1.304999999999846 | 0.271 |  |  |
| 1.309999999999846 | 0.27 |  |  |
| 1.314999999999846 | 0.268 |  |  |
| 1.319999999999845 | 0.267 |  |  |
| 1.324999999999845 | 0.266 |  |  |
| 1.329999999999845 | 0.264 |  |  |
| 1.334999999999845 | 0.263 |  |  |
| 1.339999999999845 | 0.262 |  |  |
| 1.344999999999845 | 0.261 |  |  |
| 1.349999999999845 | 0.259 |  |  |
| 1.354999999999845 | 0.258 |  |  |
| 1.359999999999845 | 0.257 |  |  |
| 1.364999999999845 | 0.255 |  |  |
| 1.369999999999844 | 0.254 |  |  |
| 1.374999999999844 | 0.253 |  |  |
| 1.379999999999844 | 0.252 |  |  |
| 1.384999999999844 | 0.25 |  |  |
| 1.389999999999844 | 0.249 |  |  |
| 1.394999999999844 | 0.248 |  |  |
| 1.399999999999844 | 0.247 |  |  |
| 1.404999999999844 | 0.245 |  |  |
| 1.409999999999844 | 0.244 |  |  |
| 1.414999999999843 | 0.243 |  |  |
| 1.419999999999843 | 0.242 |  |  |
| 1.424999999999843 | 0.241 |  |  |
| 1.429999999999843 | 0.239 |  |  |
| 1.434999999999843 | 0.238 |  |  |
| 1.439999999999843 | 0.237 |  |  |
| 1.444999999999843 | 0.236 |  |  |
| 1.449999999999843 | 0.235 |  |  |
| 1.454999999999843 | 0.233 |  |  |
| 1.459999999999842 | 0.232 |  |  |
| 1.464999999999842 | 0.231 |  |  |
| 1.469999999999842 | 0.23 |  |  |
| 1.474999999999842 | 0.229 |  |  |
| 1.479999999999842 | 0.228 |  |  |
| 1.484999999999842 | 0.227 |  |  |
| 1.489999999999842 | 0.225 |  |  |
| 1.494999999999842 | 0.224 |  |  |
| 1.499999999999842 | 0.223 |  |  |
| 1.504999999999842 | 0.222 |  |  |
| 1.509999999999841 | 0.221 |  |  |
| 1.514999999999841 | 0.22 |  |  |
| 1.519999999999841 | 0.219 |  |  |
| 1.524999999999841 | 0.218 |  |  |
| 1.529999999999841 | 0.217 |  |  |
| 1.534999999999841 | 0.215 |  |  |
| 1.539999999999841 | 0.214 |  |  |
| 1.544999999999841 | 0.213 |  |  |
| 1.549999999999841 | 0.212 |  |  |
| 1.55499999999984 | 0.211 |  |  |
| 1.55999999999984 | 0.21 |  |  |
| 1.56499999999984 | 0.209 |  |  |
| 1.56999999999984 | 0.208 |  |  |
| 1.57499999999984 | 0.207 |  |  |
| 1.57999999999984 | 0.206 |  |  |
| 1.58499999999984 | 0.205 |  |  |
| 1.58999999999984 | 0.204 |  |  |
| 1.59499999999984 | 0.203 |  |  |
| 1.59999999999984 | 0.202 |  |  |
| 1.604999999999839 | 0.201 |  |  |
| 1.609999999999839 | 0.2 |  |  |
| 1.614999999999839 | 0.199 |  |  |
| 1.619999999999839 | 0.198 |  |  |
| 1.624999999999839 | 0.197 |  |  |
| 1.629999999999839 | 0.196 |  |  |
| 1.634999999999839 | 0.195 |  |  |
| 1.639999999999839 | 0.194 |  |  |
| 1.644999999999838 | 0.193 |  |  |
| 1.649999999999838 | 0.192 |  |  |
| 1.654999999999838 | 0.191 |  |  |
| 1.659999999999838 | 0.19 |  |  |
| 1.664999999999838 | 0.189 |  |  |
| 1.669999999999838 | 0.188 |  |  |
| 1.674999999999838 | 0.187 |  |  |
| 1.679999999999838 | 0.186 |  |  |
| 1.684999999999838 | 0.185 |  |  |
| 1.689999999999838 | 0.185 |  |  |
| 1.694999999999837 | 0.184 |  |  |
| 1.699999999999837 | 0.183 |  |  |
| 1.704999999999837 | 0.182 |  |  |
| 1.709999999999837 | 0.181 |  |  |
| 1.714999999999837 | 0.18 |  |  |
| 1.719999999999837 | 0.179 |  |  |
| 1.724999999999837 | 0.178 |  |  |
| 1.729999999999837 | 0.177 |  |  |
| 1.734999999999837 | 0.176 |  |  |
| 1.739999999999836 | 0.176 |  |  |
| 1.744999999999836 | 0.175 |  |  |
| 1.749999999999836 | 0.174 |  |  |
| 1.754999999999836 | 0.173 |  |  |
| 1.759999999999836 | 0.172 |  |  |
| 1.764999999999836 | 0.171 |  |  |
| 1.769999999999836 | 0.17 |  |  |
| 1.774999999999836 | 0.169 |  |  |
| 1.779999999999836 | 0.169 |  |  |
| 1.784999999999836 | 0.168 |  |  |
| 1.789999999999835 | 0.167 |  |  |
| 1.794999999999835 | 0.166 |  |  |
| 1.799999999999835 | 0.165 |  |  |
| 1.804999999999835 | 0.164 |  |  |
| 1.809999999999835 | 0.164 |  |  |
| 1.814999999999835 | 0.163 |  |  |
| 1.819999999999835 | 0.162 |  |  |
| 1.824999999999835 | 0.161 |  |  |
| 1.829999999999835 | 0.16 |  |  |
| 1.834999999999834 | 0.16 |  |  |
| 1.839999999999834 | 0.159 |  |  |
| 1.844999999999834 | 0.158 |  |  |
| 1.849999999999834 | 0.157 |  |  |
| 1.854999999999834 | 0.156 |  |  |
| 1.859999999999834 | 0.156 |  |  |
| 1.864999999999834 | 0.155 |  |  |
| 1.869999999999834 | 0.154 |  |  |
| 1.874999999999834 | 0.153 |  |  |
| 1.879999999999834 | 0.153 |  |  |
| 1.884999999999833 | 0.152 |  |  |
| 1.889999999999833 | 0.151 |  |  |
| 1.894999999999833 | 0.15 |  |  |
| 1.899999999999833 | 0.15 |  |  |
| 1.904999999999833 | 0.149 |  |  |
| 1.909999999999833 | 0.148 |  |  |
| 1.914999999999833 | 0.147 |  |  |
| 1.919999999999833 | 0.147 |  |  |
| 1.924999999999833 | 0.146 |  |  |
| 1.929999999999832 | 0.145 |  |  |
| 1.934999999999832 | 0.144 |  |  |
| 1.939999999999832 | 0.144 |  |  |
| 1.944999999999832 | 0.143 |  |  |
| 1.949999999999832 | 0.142 |  |  |
| 1.954999999999832 | 0.142 |  |  |
| 1.959999999999832 | 0.141 |  |  |
| 1.964999999999832 | 0.14 |  |  |
| 1.969999999999832 | 0.139 |  |  |
| 1.974999999999832 | 0.139 |  |  |
| 1.979999999999831 | 0.138 |  |  |
| 1.984999999999831 | 0.137 |  |  |
| 1.989999999999831 | 0.137 |  |  |
| 1.994999999999831 | 0.136 |  |  |
| 1.999999999999831 | 0.135 |  |  |